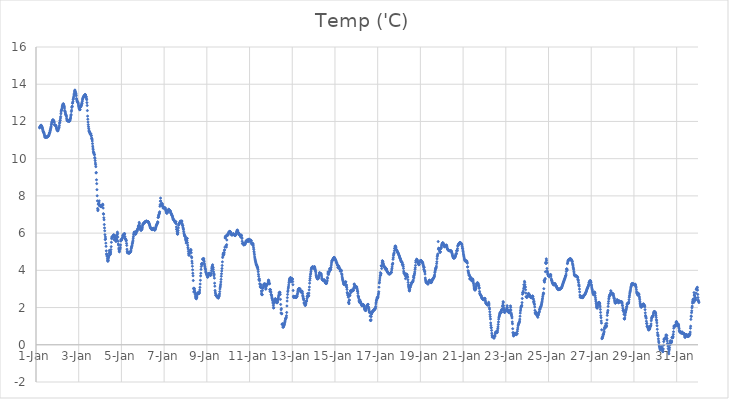
| Category | Temp ('C) |
|---|---|
| 44562.166666666664 | 11.653 |
| 44562.177083333336 | 11.686 |
| 44562.1875 | 11.711 |
| 44562.197916666664 | 11.734 |
| 44562.208333333336 | 11.743 |
| 44562.21875 | 11.776 |
| 44562.229166666664 | 11.792 |
| 44562.239583333336 | 11.8 |
| 44562.25 | 11.762 |
| 44562.260416666664 | 11.75 |
| 44562.270833333336 | 11.735 |
| 44562.28125 | 11.699 |
| 44562.291666666664 | 11.669 |
| 44562.302083333336 | 11.627 |
| 44562.3125 | 11.573 |
| 44562.322916666664 | 11.516 |
| 44562.333333333336 | 11.466 |
| 44562.34375 | 11.437 |
| 44562.354166666664 | 11.416 |
| 44562.364583333336 | 11.396 |
| 44562.375 | 11.367 |
| 44562.385416666664 | 11.321 |
| 44562.395833333336 | 11.268 |
| 44562.40625 | 11.213 |
| 44562.416666666664 | 11.162 |
| 44562.427083333336 | 11.152 |
| 44562.4375 | 11.145 |
| 44562.447916666664 | 11.148 |
| 44562.458333333336 | 11.16 |
| 44562.46875 | 11.163 |
| 44562.479166666664 | 11.164 |
| 44562.489583333336 | 11.163 |
| 44562.5 | 11.165 |
| 44562.510416666664 | 11.163 |
| 44562.520833333336 | 11.162 |
| 44562.53125 | 11.174 |
| 44562.541666666664 | 11.178 |
| 44562.552083333336 | 11.177 |
| 44562.5625 | 11.188 |
| 44562.572916666664 | 11.216 |
| 44562.583333333336 | 11.239 |
| 44562.59375 | 11.242 |
| 44562.604166666664 | 11.268 |
| 44562.614583333336 | 11.314 |
| 44562.625 | 11.342 |
| 44562.635416666664 | 11.393 |
| 44562.645833333336 | 11.407 |
| 44562.65625 | 11.481 |
| 44562.666666666664 | 11.5 |
| 44562.677083333336 | 11.56 |
| 44562.6875 | 11.618 |
| 44562.697916666664 | 11.675 |
| 44562.708333333336 | 11.735 |
| 44562.71875 | 11.822 |
| 44562.729166666664 | 11.869 |
| 44562.739583333336 | 11.942 |
| 44562.75 | 11.98 |
| 44562.760416666664 | 12.007 |
| 44562.770833333336 | 12.048 |
| 44562.78125 | 12.068 |
| 44562.791666666664 | 12.091 |
| 44562.802083333336 | 12.08 |
| 44562.8125 | 12.052 |
| 44562.822916666664 | 12.029 |
| 44562.833333333336 | 12.02 |
| 44562.84375 | 12.016 |
| 44562.854166666664 | 11.953 |
| 44562.864583333336 | 11.833 |
| 44562.875 | 11.815 |
| 44562.885416666664 | 11.799 |
| 44562.895833333336 | 11.8 |
| 44562.90625 | 11.796 |
| 44562.916666666664 | 11.79 |
| 44562.927083333336 | 11.78 |
| 44562.9375 | 11.744 |
| 44562.947916666664 | 11.699 |
| 44562.958333333336 | 11.644 |
| 44562.96875 | 11.608 |
| 44562.979166666664 | 11.556 |
| 44562.989583333336 | 11.538 |
| 44563.0 | 11.521 |
| 44563.010416666664 | 11.506 |
| 44563.020833333336 | 11.498 |
| 44563.03125 | 11.497 |
| 44563.041666666664 | 11.579 |
| 44563.052083333336 | 11.621 |
| 44563.0625 | 11.634 |
| 44563.072916666664 | 11.665 |
| 44563.083333333336 | 11.705 |
| 44563.09375 | 11.792 |
| 44563.104166666664 | 11.906 |
| 44563.114583333336 | 11.948 |
| 44563.125 | 12.044 |
| 44563.135416666664 | 12.073 |
| 44563.145833333336 | 12.179 |
| 44563.15625 | 12.264 |
| 44563.166666666664 | 12.414 |
| 44563.177083333336 | 12.515 |
| 44563.1875 | 12.594 |
| 44563.197916666664 | 12.608 |
| 44563.208333333336 | 12.662 |
| 44563.21875 | 12.721 |
| 44563.229166666664 | 12.784 |
| 44563.239583333336 | 12.838 |
| 44563.25 | 12.876 |
| 44563.260416666664 | 12.915 |
| 44563.270833333336 | 12.939 |
| 44563.28125 | 12.95 |
| 44563.291666666664 | 12.912 |
| 44563.302083333336 | 12.872 |
| 44563.3125 | 12.833 |
| 44563.322916666664 | 12.792 |
| 44563.333333333336 | 12.719 |
| 44563.34375 | 12.595 |
| 44563.354166666664 | 12.549 |
| 44563.364583333336 | 12.517 |
| 44563.375 | 12.461 |
| 44563.385416666664 | 12.396 |
| 44563.395833333336 | 12.368 |
| 44563.40625 | 12.339 |
| 44563.416666666664 | 12.313 |
| 44563.427083333336 | 12.252 |
| 44563.4375 | 12.157 |
| 44563.447916666664 | 12.091 |
| 44563.458333333336 | 12.063 |
| 44563.46875 | 12.038 |
| 44563.479166666664 | 12.035 |
| 44563.489583333336 | 12.02 |
| 44563.5 | 12.035 |
| 44563.510416666664 | 12.028 |
| 44563.520833333336 | 12.026 |
| 44563.53125 | 12.025 |
| 44563.541666666664 | 12.026 |
| 44563.552083333336 | 12.018 |
| 44563.5625 | 12.006 |
| 44563.572916666664 | 12.018 |
| 44563.583333333336 | 12.092 |
| 44563.59375 | 12.052 |
| 44563.604166666664 | 12.129 |
| 44563.614583333336 | 12.17 |
| 44563.625 | 12.239 |
| 44563.635416666664 | 12.324 |
| 44563.645833333336 | 12.372 |
| 44563.65625 | 12.53 |
| 44563.666666666664 | 12.604 |
| 44563.677083333336 | 12.75 |
| 44563.6875 | 12.798 |
| 44563.697916666664 | 12.817 |
| 44563.708333333336 | 12.978 |
| 44563.71875 | 12.995 |
| 44563.729166666664 | 13.073 |
| 44563.739583333336 | 13.185 |
| 44563.75 | 13.213 |
| 44563.760416666664 | 13.286 |
| 44563.770833333336 | 13.358 |
| 44563.78125 | 13.432 |
| 44563.791666666664 | 13.501 |
| 44563.802083333336 | 13.584 |
| 44563.8125 | 13.65 |
| 44563.822916666664 | 13.689 |
| 44563.833333333336 | 13.632 |
| 44563.84375 | 13.591 |
| 44563.854166666664 | 13.549 |
| 44563.864583333336 | 13.497 |
| 44563.875 | 13.466 |
| 44563.885416666664 | 13.382 |
| 44563.895833333336 | 13.233 |
| 44563.90625 | 13.195 |
| 44563.916666666664 | 13.131 |
| 44563.927083333336 | 13.086 |
| 44563.9375 | 13.055 |
| 44563.947916666664 | 13.051 |
| 44563.958333333336 | 13.041 |
| 44563.96875 | 13.015 |
| 44563.979166666664 | 12.952 |
| 44563.989583333336 | 12.877 |
| 44564.0 | 12.81 |
| 44564.010416666664 | 12.758 |
| 44564.020833333336 | 12.703 |
| 44564.03125 | 12.663 |
| 44564.041666666664 | 12.643 |
| 44564.052083333336 | 12.626 |
| 44564.0625 | 12.634 |
| 44564.072916666664 | 12.762 |
| 44564.083333333336 | 12.764 |
| 44564.09375 | 12.793 |
| 44564.104166666664 | 12.836 |
| 44564.114583333336 | 12.833 |
| 44564.125 | 12.857 |
| 44564.135416666664 | 12.92 |
| 44564.145833333336 | 12.992 |
| 44564.15625 | 12.97 |
| 44564.166666666664 | 13.082 |
| 44564.177083333336 | 13.164 |
| 44564.1875 | 13.222 |
| 44564.197916666664 | 13.254 |
| 44564.208333333336 | 13.294 |
| 44564.21875 | 13.322 |
| 44564.229166666664 | 13.346 |
| 44564.239583333336 | 13.338 |
| 44564.25 | 13.369 |
| 44564.260416666664 | 13.374 |
| 44564.270833333336 | 13.396 |
| 44564.28125 | 13.422 |
| 44564.291666666664 | 13.429 |
| 44564.302083333336 | 13.448 |
| 44564.3125 | 13.434 |
| 44564.322916666664 | 13.419 |
| 44564.333333333336 | 13.321 |
| 44564.34375 | 13.332 |
| 44564.354166666664 | 13.311 |
| 44564.364583333336 | 13.224 |
| 44564.375 | 13.168 |
| 44564.385416666664 | 13.012 |
| 44564.395833333336 | 12.858 |
| 44564.40625 | 12.584 |
| 44564.416666666664 | 12.286 |
| 44564.427083333336 | 12.12 |
| 44564.4375 | 11.968 |
| 44564.447916666664 | 11.829 |
| 44564.458333333336 | 11.719 |
| 44564.46875 | 11.617 |
| 44564.479166666664 | 11.529 |
| 44564.489583333336 | 11.455 |
| 44564.5 | 11.462 |
| 44564.510416666664 | 11.439 |
| 44564.520833333336 | 11.388 |
| 44564.53125 | 11.343 |
| 44564.541666666664 | 11.32 |
| 44564.552083333336 | 11.34 |
| 44564.5625 | 11.329 |
| 44564.572916666664 | 11.33 |
| 44564.583333333336 | 11.227 |
| 44564.59375 | 11.24 |
| 44564.604166666664 | 11.104 |
| 44564.614583333336 | 11.09 |
| 44564.625 | 11.03 |
| 44564.635416666664 | 10.948 |
| 44564.645833333336 | 10.808 |
| 44564.65625 | 10.672 |
| 44564.666666666664 | 10.571 |
| 44564.677083333336 | 10.487 |
| 44564.6875 | 10.383 |
| 44564.697916666664 | 10.321 |
| 44564.708333333336 | 10.304 |
| 44564.71875 | 10.298 |
| 44564.729166666664 | 10.229 |
| 44564.739583333336 | 10.209 |
| 44564.75 | 10.063 |
| 44564.760416666664 | 10.008 |
| 44564.770833333336 | 9.892 |
| 44564.78125 | 9.765 |
| 44564.791666666664 | 9.677 |
| 44564.802083333336 | 9.569 |
| 44564.8125 | 9.232 |
| 44564.822916666664 | 9.254 |
| 44564.833333333336 | 8.863 |
| 44564.84375 | 8.658 |
| 44564.854166666664 | 8.334 |
| 44564.864583333336 | 8.005 |
| 44564.875 | 7.733 |
| 44564.885416666664 | 7.324 |
| 44564.895833333336 | 7.207 |
| 44564.90625 | 7.257 |
| 44564.916666666664 | 7.551 |
| 44564.927083333336 | 7.576 |
| 44564.9375 | 7.554 |
| 44564.947916666664 | 7.664 |
| 44564.958333333336 | 7.733 |
| 44564.96875 | 7.473 |
| 44564.979166666664 | 7.481 |
| 44564.989583333336 | 7.517 |
| 44565.0 | 7.473 |
| 44565.010416666664 | 7.484 |
| 44565.020833333336 | 7.464 |
| 44565.03125 | 7.455 |
| 44565.041666666664 | 7.416 |
| 44565.052083333336 | 7.427 |
| 44565.0625 | 7.426 |
| 44565.072916666664 | 7.438 |
| 44565.083333333336 | 7.469 |
| 44565.09375 | 7.502 |
| 44565.104166666664 | 7.497 |
| 44565.114583333336 | 7.528 |
| 44565.125 | 7.553 |
| 44565.135416666664 | 7.506 |
| 44565.145833333336 | 7.346 |
| 44565.15625 | 7.044 |
| 44565.166666666664 | 7.017 |
| 44565.177083333336 | 6.826 |
| 44565.1875 | 6.715 |
| 44565.197916666664 | 6.461 |
| 44565.208333333336 | 6.279 |
| 44565.21875 | 6.123 |
| 44565.229166666664 | 5.917 |
| 44565.239583333336 | 5.652 |
| 44565.25 | 5.792 |
| 44565.260416666664 | 5.684 |
| 44565.270833333336 | 5.461 |
| 44565.28125 | 5.289 |
| 44565.291666666664 | 5.046 |
| 44565.302083333336 | 4.882 |
| 44565.3125 | 4.861 |
| 44565.322916666664 | 4.787 |
| 44565.333333333336 | 4.739 |
| 44565.34375 | 4.618 |
| 44565.354166666664 | 4.521 |
| 44565.364583333336 | 4.482 |
| 44565.375 | 4.521 |
| 44565.385416666664 | 4.553 |
| 44565.395833333336 | 4.665 |
| 44565.40625 | 4.728 |
| 44565.416666666664 | 4.79 |
| 44565.427083333336 | 4.924 |
| 44565.4375 | 5.073 |
| 44565.447916666664 | 5.028 |
| 44565.458333333336 | 4.935 |
| 44565.46875 | 4.851 |
| 44565.479166666664 | 4.852 |
| 44565.489583333336 | 4.915 |
| 44565.5 | 4.986 |
| 44565.510416666664 | 5.112 |
| 44565.520833333336 | 5.271 |
| 44565.53125 | 5.505 |
| 44565.541666666664 | 5.702 |
| 44565.552083333336 | 5.779 |
| 44565.5625 | 5.811 |
| 44565.572916666664 | 5.786 |
| 44565.583333333336 | 5.775 |
| 44565.59375 | 5.79 |
| 44565.604166666664 | 5.819 |
| 44565.614583333336 | 5.856 |
| 44565.625 | 5.889 |
| 44565.635416666664 | 5.913 |
| 44565.645833333336 | 5.847 |
| 44565.65625 | 5.658 |
| 44565.666666666664 | 5.653 |
| 44565.677083333336 | 5.881 |
| 44565.6875 | 5.862 |
| 44565.697916666664 | 5.799 |
| 44565.708333333336 | 5.754 |
| 44565.71875 | 5.759 |
| 44565.729166666664 | 5.73 |
| 44565.739583333336 | 5.555 |
| 44565.75 | 5.565 |
| 44565.760416666664 | 5.69 |
| 44565.770833333336 | 5.634 |
| 44565.78125 | 5.671 |
| 44565.791666666664 | 5.845 |
| 44565.802083333336 | 5.92 |
| 44565.8125 | 6.053 |
| 44565.822916666664 | 5.979 |
| 44565.833333333336 | 5.787 |
| 44565.84375 | 5.563 |
| 44565.854166666664 | 5.414 |
| 44565.864583333336 | 5.355 |
| 44565.875 | 5.193 |
| 44565.885416666664 | 5.107 |
| 44565.895833333336 | 5.03 |
| 44565.90625 | 4.992 |
| 44565.916666666664 | 5.106 |
| 44565.927083333336 | 5.134 |
| 44565.9375 | 5.174 |
| 44565.947916666664 | 5.237 |
| 44565.958333333336 | 5.367 |
| 44565.96875 | 5.576 |
| 44565.979166666664 | 5.639 |
| 44565.989583333336 | 5.637 |
| 44566.0 | 5.654 |
| 44566.010416666664 | 5.629 |
| 44566.020833333336 | 5.673 |
| 44566.03125 | 5.718 |
| 44566.041666666664 | 5.738 |
| 44566.052083333336 | 5.766 |
| 44566.0625 | 5.846 |
| 44566.072916666664 | 5.885 |
| 44566.083333333336 | 5.898 |
| 44566.09375 | 5.909 |
| 44566.104166666664 | 5.923 |
| 44566.114583333336 | 5.945 |
| 44566.125 | 5.954 |
| 44566.135416666664 | 5.958 |
| 44566.145833333336 | 5.972 |
| 44566.15625 | 5.959 |
| 44566.166666666664 | 5.814 |
| 44566.177083333336 | 5.718 |
| 44566.1875 | 5.691 |
| 44566.197916666664 | 5.666 |
| 44566.208333333336 | 5.65 |
| 44566.21875 | 5.581 |
| 44566.229166666664 | 5.6 |
| 44566.239583333336 | 5.449 |
| 44566.25 | 5.339 |
| 44566.260416666664 | 5.136 |
| 44566.270833333336 | 5.029 |
| 44566.28125 | 4.939 |
| 44566.291666666664 | 4.975 |
| 44566.302083333336 | 4.953 |
| 44566.3125 | 4.948 |
| 44566.322916666664 | 4.969 |
| 44566.333333333336 | 4.964 |
| 44566.34375 | 4.92 |
| 44566.354166666664 | 4.92 |
| 44566.364583333336 | 4.934 |
| 44566.375 | 4.944 |
| 44566.385416666664 | 4.942 |
| 44566.395833333336 | 4.96 |
| 44566.40625 | 4.965 |
| 44566.416666666664 | 4.98 |
| 44566.427083333336 | 5.009 |
| 44566.4375 | 5.026 |
| 44566.447916666664 | 5.083 |
| 44566.458333333336 | 5.16 |
| 44566.46875 | 5.217 |
| 44566.479166666664 | 5.269 |
| 44566.489583333336 | 5.305 |
| 44566.5 | 5.355 |
| 44566.510416666664 | 5.427 |
| 44566.520833333336 | 5.477 |
| 44566.53125 | 5.542 |
| 44566.541666666664 | 5.62 |
| 44566.552083333336 | 5.727 |
| 44566.5625 | 5.821 |
| 44566.572916666664 | 5.922 |
| 44566.583333333336 | 5.984 |
| 44566.59375 | 6.043 |
| 44566.604166666664 | 6.059 |
| 44566.614583333336 | 6.032 |
| 44566.625 | 5.994 |
| 44566.635416666664 | 5.968 |
| 44566.645833333336 | 5.954 |
| 44566.65625 | 5.94 |
| 44566.666666666664 | 5.945 |
| 44566.677083333336 | 6.01 |
| 44566.6875 | 5.982 |
| 44566.697916666664 | 6.046 |
| 44566.708333333336 | 6.111 |
| 44566.71875 | 6.12 |
| 44566.729166666664 | 6.103 |
| 44566.739583333336 | 6.123 |
| 44566.75 | 6.193 |
| 44566.760416666664 | 6.196 |
| 44566.770833333336 | 6.254 |
| 44566.78125 | 6.255 |
| 44566.791666666664 | 6.369 |
| 44566.802083333336 | 6.36 |
| 44566.8125 | 6.412 |
| 44566.822916666664 | 6.432 |
| 44566.833333333336 | 6.576 |
| 44566.84375 | 6.502 |
| 44566.854166666664 | 6.388 |
| 44566.864583333336 | 6.284 |
| 44566.875 | 6.319 |
| 44566.885416666664 | 6.218 |
| 44566.895833333336 | 6.31 |
| 44566.90625 | 6.17 |
| 44566.916666666664 | 6.153 |
| 44566.927083333336 | 6.153 |
| 44566.9375 | 6.212 |
| 44566.947916666664 | 6.194 |
| 44566.958333333336 | 6.214 |
| 44566.96875 | 6.24 |
| 44566.979166666664 | 6.313 |
| 44566.989583333336 | 6.395 |
| 44567.0 | 6.447 |
| 44567.010416666664 | 6.486 |
| 44567.020833333336 | 6.503 |
| 44567.03125 | 6.52 |
| 44567.041666666664 | 6.53 |
| 44567.052083333336 | 6.537 |
| 44567.0625 | 6.539 |
| 44567.072916666664 | 6.548 |
| 44567.083333333336 | 6.569 |
| 44567.09375 | 6.591 |
| 44567.104166666664 | 6.602 |
| 44567.114583333336 | 6.611 |
| 44567.125 | 6.619 |
| 44567.135416666664 | 6.626 |
| 44567.145833333336 | 6.634 |
| 44567.15625 | 6.638 |
| 44567.166666666664 | 6.643 |
| 44567.177083333336 | 6.643 |
| 44567.1875 | 6.633 |
| 44567.197916666664 | 6.634 |
| 44567.208333333336 | 6.623 |
| 44567.21875 | 6.613 |
| 44567.229166666664 | 6.609 |
| 44567.239583333336 | 6.624 |
| 44567.25 | 6.614 |
| 44567.260416666664 | 6.602 |
| 44567.270833333336 | 6.585 |
| 44567.28125 | 6.557 |
| 44567.291666666664 | 6.52 |
| 44567.302083333336 | 6.494 |
| 44567.3125 | 6.464 |
| 44567.322916666664 | 6.425 |
| 44567.333333333336 | 6.382 |
| 44567.34375 | 6.341 |
| 44567.354166666664 | 6.307 |
| 44567.364583333336 | 6.283 |
| 44567.375 | 6.261 |
| 44567.385416666664 | 6.237 |
| 44567.395833333336 | 6.223 |
| 44567.40625 | 6.236 |
| 44567.416666666664 | 6.194 |
| 44567.427083333336 | 6.204 |
| 44567.4375 | 6.182 |
| 44567.447916666664 | 6.195 |
| 44567.458333333336 | 6.227 |
| 44567.46875 | 6.231 |
| 44567.479166666664 | 6.238 |
| 44567.489583333336 | 6.232 |
| 44567.5 | 6.262 |
| 44567.510416666664 | 6.21 |
| 44567.520833333336 | 6.214 |
| 44567.53125 | 6.207 |
| 44567.541666666664 | 6.177 |
| 44567.552083333336 | 6.167 |
| 44567.5625 | 6.167 |
| 44567.572916666664 | 6.171 |
| 44567.583333333336 | 6.19 |
| 44567.59375 | 6.236 |
| 44567.604166666664 | 6.284 |
| 44567.614583333336 | 6.325 |
| 44567.625 | 6.369 |
| 44567.635416666664 | 6.408 |
| 44567.645833333336 | 6.433 |
| 44567.65625 | 6.464 |
| 44567.666666666664 | 6.493 |
| 44567.677083333336 | 6.507 |
| 44567.6875 | 6.544 |
| 44567.697916666664 | 6.608 |
| 44567.708333333336 | 6.584 |
| 44567.71875 | 6.841 |
| 44567.729166666664 | 6.844 |
| 44567.739583333336 | 6.959 |
| 44567.75 | 6.918 |
| 44567.760416666664 | 7.009 |
| 44567.770833333336 | 7.085 |
| 44567.78125 | 7.059 |
| 44567.791666666664 | 7.145 |
| 44567.802083333336 | 7.439 |
| 44567.8125 | 7.521 |
| 44567.822916666664 | 7.715 |
| 44567.833333333336 | 7.882 |
| 44567.84375 | 7.723 |
| 44567.854166666664 | 7.577 |
| 44567.864583333336 | 7.498 |
| 44567.875 | 7.531 |
| 44567.885416666664 | 7.52 |
| 44567.895833333336 | 7.595 |
| 44567.90625 | 7.545 |
| 44567.916666666664 | 7.57 |
| 44567.927083333336 | 7.485 |
| 44567.9375 | 7.416 |
| 44567.947916666664 | 7.401 |
| 44567.958333333336 | 7.338 |
| 44567.96875 | 7.396 |
| 44567.979166666664 | 7.367 |
| 44567.989583333336 | 7.357 |
| 44568.0 | 7.358 |
| 44568.010416666664 | 7.352 |
| 44568.020833333336 | 7.351 |
| 44568.03125 | 7.35 |
| 44568.041666666664 | 7.354 |
| 44568.052083333336 | 7.353 |
| 44568.0625 | 7.295 |
| 44568.072916666664 | 7.245 |
| 44568.083333333336 | 7.214 |
| 44568.09375 | 7.168 |
| 44568.104166666664 | 7.121 |
| 44568.114583333336 | 7.086 |
| 44568.125 | 7.068 |
| 44568.135416666664 | 7.076 |
| 44568.145833333336 | 7.093 |
| 44568.15625 | 7.12 |
| 44568.166666666664 | 7.145 |
| 44568.177083333336 | 7.18 |
| 44568.1875 | 7.203 |
| 44568.197916666664 | 7.241 |
| 44568.208333333336 | 7.268 |
| 44568.21875 | 7.286 |
| 44568.229166666664 | 7.235 |
| 44568.239583333336 | 7.231 |
| 44568.25 | 7.224 |
| 44568.260416666664 | 7.218 |
| 44568.270833333336 | 7.203 |
| 44568.28125 | 7.202 |
| 44568.291666666664 | 7.168 |
| 44568.302083333336 | 7.132 |
| 44568.3125 | 7.089 |
| 44568.322916666664 | 7.061 |
| 44568.333333333336 | 7.044 |
| 44568.34375 | 7.01 |
| 44568.354166666664 | 6.973 |
| 44568.364583333336 | 6.968 |
| 44568.375 | 6.951 |
| 44568.385416666664 | 6.906 |
| 44568.395833333336 | 6.868 |
| 44568.40625 | 6.817 |
| 44568.416666666664 | 6.768 |
| 44568.427083333336 | 6.73 |
| 44568.4375 | 6.735 |
| 44568.447916666664 | 6.724 |
| 44568.458333333336 | 6.701 |
| 44568.46875 | 6.675 |
| 44568.479166666664 | 6.659 |
| 44568.489583333336 | 6.648 |
| 44568.5 | 6.606 |
| 44568.510416666664 | 6.591 |
| 44568.520833333336 | 6.599 |
| 44568.53125 | 6.554 |
| 44568.541666666664 | 6.618 |
| 44568.552083333336 | 6.606 |
| 44568.5625 | 6.5 |
| 44568.572916666664 | 6.331 |
| 44568.583333333336 | 6.209 |
| 44568.59375 | 6.198 |
| 44568.604166666664 | 6.102 |
| 44568.614583333336 | 5.999 |
| 44568.625 | 5.944 |
| 44568.635416666664 | 5.944 |
| 44568.645833333336 | 6.025 |
| 44568.65625 | 6.137 |
| 44568.666666666664 | 6.279 |
| 44568.677083333336 | 6.418 |
| 44568.6875 | 6.456 |
| 44568.697916666664 | 6.499 |
| 44568.708333333336 | 6.522 |
| 44568.71875 | 6.541 |
| 44568.729166666664 | 6.518 |
| 44568.739583333336 | 6.555 |
| 44568.75 | 6.627 |
| 44568.760416666664 | 6.647 |
| 44568.770833333336 | 6.621 |
| 44568.78125 | 6.624 |
| 44568.791666666664 | 6.59 |
| 44568.802083333336 | 6.605 |
| 44568.8125 | 6.63 |
| 44568.822916666664 | 6.645 |
| 44568.833333333336 | 6.648 |
| 44568.84375 | 6.517 |
| 44568.854166666664 | 6.445 |
| 44568.864583333336 | 6.399 |
| 44568.875 | 6.398 |
| 44568.885416666664 | 6.296 |
| 44568.895833333336 | 6.234 |
| 44568.90625 | 6.188 |
| 44568.916666666664 | 6.083 |
| 44568.927083333336 | 6.001 |
| 44568.9375 | 5.95 |
| 44568.947916666664 | 5.897 |
| 44568.958333333336 | 5.884 |
| 44568.96875 | 5.82 |
| 44568.979166666664 | 5.825 |
| 44568.989583333336 | 5.833 |
| 44569.0 | 5.694 |
| 44569.010416666664 | 5.642 |
| 44569.020833333336 | 5.594 |
| 44569.03125 | 5.466 |
| 44569.041666666664 | 5.536 |
| 44569.052083333336 | 5.606 |
| 44569.0625 | 5.605 |
| 44569.072916666664 | 5.722 |
| 44569.083333333336 | 5.709 |
| 44569.09375 | 5.487 |
| 44569.104166666664 | 5.351 |
| 44569.114583333336 | 5.228 |
| 44569.125 | 5.146 |
| 44569.135416666664 | 5.02 |
| 44569.145833333336 | 4.909 |
| 44569.15625 | 4.828 |
| 44569.166666666664 | 4.809 |
| 44569.177083333336 | 4.83 |
| 44569.1875 | 4.923 |
| 44569.197916666664 | 4.98 |
| 44569.208333333336 | 5.031 |
| 44569.21875 | 5.052 |
| 44569.229166666664 | 5.043 |
| 44569.239583333336 | 5.095 |
| 44569.25 | 5.12 |
| 44569.260416666664 | 5.076 |
| 44569.270833333336 | 4.944 |
| 44569.28125 | 4.735 |
| 44569.291666666664 | 4.676 |
| 44569.302083333336 | 4.495 |
| 44569.3125 | 4.382 |
| 44569.322916666664 | 4.219 |
| 44569.333333333336 | 4.027 |
| 44569.34375 | 3.843 |
| 44569.354166666664 | 3.706 |
| 44569.364583333336 | 3.452 |
| 44569.375 | 3.019 |
| 44569.385416666664 | 2.841 |
| 44569.395833333336 | 3.046 |
| 44569.40625 | 3 |
| 44569.416666666664 | 3.017 |
| 44569.427083333336 | 2.925 |
| 44569.4375 | 2.844 |
| 44569.447916666664 | 2.789 |
| 44569.458333333336 | 2.701 |
| 44569.46875 | 2.611 |
| 44569.479166666664 | 2.518 |
| 44569.489583333336 | 2.53 |
| 44569.5 | 2.491 |
| 44569.510416666664 | 2.471 |
| 44569.520833333336 | 2.523 |
| 44569.53125 | 2.559 |
| 44569.541666666664 | 2.628 |
| 44569.552083333336 | 2.715 |
| 44569.5625 | 2.774 |
| 44569.572916666664 | 2.76 |
| 44569.583333333336 | 2.758 |
| 44569.59375 | 2.808 |
| 44569.604166666664 | 2.769 |
| 44569.614583333336 | 2.77 |
| 44569.625 | 2.76 |
| 44569.635416666664 | 2.757 |
| 44569.645833333336 | 2.783 |
| 44569.65625 | 2.838 |
| 44569.666666666664 | 2.943 |
| 44569.677083333336 | 3.083 |
| 44569.6875 | 3.264 |
| 44569.697916666664 | 3.466 |
| 44569.708333333336 | 3.7 |
| 44569.71875 | 3.844 |
| 44569.729166666664 | 4.051 |
| 44569.739583333336 | 4.203 |
| 44569.75 | 4.317 |
| 44569.760416666664 | 4.36 |
| 44569.770833333336 | 4.372 |
| 44569.78125 | 4.313 |
| 44569.791666666664 | 4.351 |
| 44569.802083333336 | 4.59 |
| 44569.8125 | 4.609 |
| 44569.822916666664 | 4.61 |
| 44569.833333333336 | 4.617 |
| 44569.84375 | 4.544 |
| 44569.854166666664 | 4.635 |
| 44569.864583333336 | 4.548 |
| 44569.875 | 4.46 |
| 44569.885416666664 | 4.362 |
| 44569.895833333336 | 4.287 |
| 44569.90625 | 4.211 |
| 44569.916666666664 | 4.128 |
| 44569.927083333336 | 4.085 |
| 44569.9375 | 4.039 |
| 44569.947916666664 | 3.954 |
| 44569.958333333336 | 3.888 |
| 44569.96875 | 3.867 |
| 44569.979166666664 | 3.834 |
| 44569.989583333336 | 3.779 |
| 44570.0 | 3.752 |
| 44570.010416666664 | 3.705 |
| 44570.020833333336 | 3.694 |
| 44570.03125 | 3.639 |
| 44570.041666666664 | 3.635 |
| 44570.052083333336 | 3.652 |
| 44570.0625 | 3.703 |
| 44570.072916666664 | 3.738 |
| 44570.083333333336 | 3.773 |
| 44570.09375 | 3.823 |
| 44570.104166666664 | 3.848 |
| 44570.114583333336 | 3.828 |
| 44570.125 | 3.836 |
| 44570.135416666664 | 3.813 |
| 44570.145833333336 | 3.789 |
| 44570.15625 | 3.755 |
| 44570.166666666664 | 3.732 |
| 44570.177083333336 | 3.732 |
| 44570.1875 | 3.748 |
| 44570.197916666664 | 3.774 |
| 44570.208333333336 | 3.848 |
| 44570.21875 | 3.975 |
| 44570.229166666664 | 4.079 |
| 44570.239583333336 | 4.161 |
| 44570.25 | 4.215 |
| 44570.260416666664 | 4.233 |
| 44570.270833333336 | 4.301 |
| 44570.28125 | 4.151 |
| 44570.291666666664 | 4.161 |
| 44570.302083333336 | 4.057 |
| 44570.3125 | 3.926 |
| 44570.322916666664 | 3.836 |
| 44570.333333333336 | 3.708 |
| 44570.34375 | 3.79 |
| 44570.354166666664 | 3.581 |
| 44570.364583333336 | 3.309 |
| 44570.375 | 3.148 |
| 44570.385416666664 | 2.919 |
| 44570.395833333336 | 2.831 |
| 44570.40625 | 2.752 |
| 44570.416666666664 | 2.666 |
| 44570.427083333336 | 2.659 |
| 44570.4375 | 2.667 |
| 44570.447916666664 | 2.644 |
| 44570.458333333336 | 2.639 |
| 44570.46875 | 2.612 |
| 44570.479166666664 | 2.578 |
| 44570.489583333336 | 2.55 |
| 44570.5 | 2.556 |
| 44570.510416666664 | 2.545 |
| 44570.520833333336 | 2.554 |
| 44570.53125 | 2.505 |
| 44570.541666666664 | 2.523 |
| 44570.552083333336 | 2.59 |
| 44570.5625 | 2.577 |
| 44570.572916666664 | 2.61 |
| 44570.583333333336 | 2.666 |
| 44570.59375 | 2.737 |
| 44570.604166666664 | 2.857 |
| 44570.614583333336 | 3 |
| 44570.625 | 3.094 |
| 44570.635416666664 | 3.16 |
| 44570.645833333336 | 3.252 |
| 44570.65625 | 3.376 |
| 44570.666666666664 | 3.513 |
| 44570.677083333336 | 3.679 |
| 44570.6875 | 3.816 |
| 44570.697916666664 | 3.963 |
| 44570.708333333336 | 4.099 |
| 44570.71875 | 4.26 |
| 44570.729166666664 | 4.455 |
| 44570.739583333336 | 4.688 |
| 44570.75 | 4.765 |
| 44570.760416666664 | 4.848 |
| 44570.770833333336 | 4.901 |
| 44570.78125 | 4.938 |
| 44570.791666666664 | 4.83 |
| 44570.802083333336 | 4.874 |
| 44570.8125 | 4.943 |
| 44570.822916666664 | 5.068 |
| 44570.833333333336 | 5.106 |
| 44570.84375 | 5.247 |
| 44570.854166666664 | 5.742 |
| 44570.864583333336 | 5.804 |
| 44570.875 | 5.735 |
| 44570.885416666664 | 5.847 |
| 44570.895833333336 | 5.837 |
| 44570.90625 | 5.327 |
| 44570.916666666664 | 5.251 |
| 44570.927083333336 | 5.381 |
| 44570.9375 | 5.63 |
| 44570.947916666664 | 5.858 |
| 44570.958333333336 | 5.886 |
| 44570.96875 | 5.937 |
| 44570.979166666664 | 5.897 |
| 44570.989583333336 | 5.895 |
| 44571.0 | 5.923 |
| 44571.010416666664 | 5.978 |
| 44571.020833333336 | 6.003 |
| 44571.03125 | 6.028 |
| 44571.041666666664 | 6.076 |
| 44571.052083333336 | 6.07 |
| 44571.0625 | 6.069 |
| 44571.072916666664 | 6.095 |
| 44571.083333333336 | 6.098 |
| 44571.09375 | 6.067 |
| 44571.104166666664 | 6.054 |
| 44571.114583333336 | 6.031 |
| 44571.125 | 6.009 |
| 44571.135416666664 | 5.983 |
| 44571.145833333336 | 5.944 |
| 44571.15625 | 5.894 |
| 44571.166666666664 | 5.92 |
| 44571.177083333336 | 5.913 |
| 44571.1875 | 5.904 |
| 44571.197916666664 | 5.908 |
| 44571.208333333336 | 5.922 |
| 44571.21875 | 5.944 |
| 44571.229166666664 | 5.953 |
| 44571.239583333336 | 5.957 |
| 44571.25 | 5.96 |
| 44571.260416666664 | 5.949 |
| 44571.270833333336 | 5.933 |
| 44571.28125 | 5.905 |
| 44571.291666666664 | 5.887 |
| 44571.302083333336 | 5.893 |
| 44571.3125 | 5.891 |
| 44571.322916666664 | 5.861 |
| 44571.333333333336 | 5.888 |
| 44571.34375 | 5.904 |
| 44571.354166666664 | 5.914 |
| 44571.364583333336 | 5.935 |
| 44571.375 | 5.915 |
| 44571.385416666664 | 6.054 |
| 44571.395833333336 | 6.023 |
| 44571.40625 | 6.108 |
| 44571.416666666664 | 6.158 |
| 44571.427083333336 | 6.16 |
| 44571.4375 | 6.144 |
| 44571.447916666664 | 6.12 |
| 44571.458333333336 | 6.063 |
| 44571.46875 | 6.026 |
| 44571.479166666664 | 6.004 |
| 44571.489583333336 | 5.997 |
| 44571.5 | 5.97 |
| 44571.510416666664 | 5.948 |
| 44571.520833333336 | 5.912 |
| 44571.53125 | 5.898 |
| 44571.541666666664 | 5.892 |
| 44571.552083333336 | 5.918 |
| 44571.5625 | 5.872 |
| 44571.572916666664 | 5.81 |
| 44571.583333333336 | 5.815 |
| 44571.59375 | 5.842 |
| 44571.604166666664 | 5.89 |
| 44571.614583333336 | 5.888 |
| 44571.625 | 5.864 |
| 44571.635416666664 | 5.754 |
| 44571.645833333336 | 5.715 |
| 44571.65625 | 5.563 |
| 44571.666666666664 | 5.443 |
| 44571.677083333336 | 5.44 |
| 44571.6875 | 5.441 |
| 44571.697916666664 | 5.431 |
| 44571.708333333336 | 5.424 |
| 44571.71875 | 5.409 |
| 44571.729166666664 | 5.355 |
| 44571.739583333336 | 5.376 |
| 44571.75 | 5.388 |
| 44571.760416666664 | 5.39 |
| 44571.770833333336 | 5.385 |
| 44571.78125 | 5.397 |
| 44571.791666666664 | 5.418 |
| 44571.802083333336 | 5.44 |
| 44571.8125 | 5.48 |
| 44571.822916666664 | 5.523 |
| 44571.833333333336 | 5.562 |
| 44571.84375 | 5.585 |
| 44571.854166666664 | 5.58 |
| 44571.864583333336 | 5.586 |
| 44571.875 | 5.579 |
| 44571.885416666664 | 5.628 |
| 44571.895833333336 | 5.641 |
| 44571.90625 | 5.559 |
| 44571.916666666664 | 5.615 |
| 44571.927083333336 | 5.587 |
| 44571.9375 | 5.543 |
| 44571.947916666664 | 5.61 |
| 44571.958333333336 | 5.62 |
| 44571.96875 | 5.66 |
| 44571.979166666664 | 5.68 |
| 44571.989583333336 | 5.649 |
| 44572.0 | 5.638 |
| 44572.010416666664 | 5.569 |
| 44572.020833333336 | 5.566 |
| 44572.03125 | 5.561 |
| 44572.041666666664 | 5.592 |
| 44572.052083333336 | 5.624 |
| 44572.0625 | 5.621 |
| 44572.072916666664 | 5.593 |
| 44572.083333333336 | 5.574 |
| 44572.09375 | 5.461 |
| 44572.104166666664 | 5.429 |
| 44572.114583333336 | 5.41 |
| 44572.125 | 5.404 |
| 44572.135416666664 | 5.389 |
| 44572.145833333336 | 5.433 |
| 44572.15625 | 5.444 |
| 44572.166666666664 | 5.387 |
| 44572.177083333336 | 5.311 |
| 44572.1875 | 5.208 |
| 44572.197916666664 | 5.119 |
| 44572.208333333336 | 5.007 |
| 44572.21875 | 4.928 |
| 44572.229166666664 | 4.834 |
| 44572.239583333336 | 4.721 |
| 44572.25 | 4.657 |
| 44572.260416666664 | 4.596 |
| 44572.270833333336 | 4.539 |
| 44572.28125 | 4.476 |
| 44572.291666666664 | 4.432 |
| 44572.302083333336 | 4.368 |
| 44572.3125 | 4.318 |
| 44572.322916666664 | 4.283 |
| 44572.333333333336 | 4.294 |
| 44572.34375 | 4.244 |
| 44572.354166666664 | 4.218 |
| 44572.364583333336 | 4.145 |
| 44572.375 | 4.169 |
| 44572.385416666664 | 4.125 |
| 44572.395833333336 | 4.041 |
| 44572.40625 | 3.926 |
| 44572.416666666664 | 3.786 |
| 44572.427083333336 | 3.678 |
| 44572.4375 | 3.484 |
| 44572.447916666664 | 3.508 |
| 44572.458333333336 | 3.549 |
| 44572.46875 | 3.444 |
| 44572.479166666664 | 3.274 |
| 44572.489583333336 | 3.261 |
| 44572.5 | 3.117 |
| 44572.510416666664 | 3.089 |
| 44572.520833333336 | 3.234 |
| 44572.53125 | 3.187 |
| 44572.541666666664 | 3.066 |
| 44572.552083333336 | 2.889 |
| 44572.5625 | 2.775 |
| 44572.572916666664 | 2.705 |
| 44572.583333333336 | 2.684 |
| 44572.59375 | 2.695 |
| 44572.604166666664 | 2.914 |
| 44572.614583333336 | 3.042 |
| 44572.625 | 3.07 |
| 44572.635416666664 | 3.057 |
| 44572.645833333336 | 3.08 |
| 44572.65625 | 3.174 |
| 44572.666666666664 | 3.24 |
| 44572.677083333336 | 3.231 |
| 44572.6875 | 3.279 |
| 44572.697916666664 | 3.271 |
| 44572.708333333336 | 3.247 |
| 44572.71875 | 3.2 |
| 44572.729166666664 | 3.24 |
| 44572.739583333336 | 3.268 |
| 44572.75 | 3.139 |
| 44572.760416666664 | 2.985 |
| 44572.770833333336 | 3.037 |
| 44572.78125 | 3.125 |
| 44572.791666666664 | 3.25 |
| 44572.802083333336 | 3.219 |
| 44572.8125 | 3.23 |
| 44572.822916666664 | 3.218 |
| 44572.833333333336 | 3.251 |
| 44572.84375 | 3.254 |
| 44572.854166666664 | 3.274 |
| 44572.864583333336 | 3.296 |
| 44572.875 | 3.377 |
| 44572.885416666664 | 3.474 |
| 44572.895833333336 | 3.457 |
| 44572.90625 | 3.413 |
| 44572.916666666664 | 3.332 |
| 44572.927083333336 | 3.285 |
| 44572.9375 | 3.28 |
| 44572.947916666664 | 2.961 |
| 44572.958333333336 | 2.875 |
| 44572.96875 | 2.968 |
| 44572.979166666664 | 2.96 |
| 44572.989583333336 | 2.855 |
| 44573.0 | 2.825 |
| 44573.010416666664 | 2.704 |
| 44573.020833333336 | 2.683 |
| 44573.03125 | 2.65 |
| 44573.041666666664 | 2.571 |
| 44573.052083333336 | 2.513 |
| 44573.0625 | 2.492 |
| 44573.072916666664 | 2.418 |
| 44573.083333333336 | 2.364 |
| 44573.09375 | 2.283 |
| 44573.104166666664 | 2.213 |
| 44573.114583333336 | 2.101 |
| 44573.125 | 1.977 |
| 44573.135416666664 | 1.988 |
| 44573.145833333336 | 2.223 |
| 44573.15625 | 2.273 |
| 44573.166666666664 | 2.295 |
| 44573.177083333336 | 2.368 |
| 44573.1875 | 2.423 |
| 44573.197916666664 | 2.449 |
| 44573.208333333336 | 2.482 |
| 44573.21875 | 2.446 |
| 44573.229166666664 | 2.425 |
| 44573.239583333336 | 2.409 |
| 44573.25 | 2.38 |
| 44573.260416666664 | 2.331 |
| 44573.270833333336 | 2.278 |
| 44573.28125 | 2.253 |
| 44573.291666666664 | 2.257 |
| 44573.302083333336 | 2.276 |
| 44573.3125 | 2.313 |
| 44573.322916666664 | 2.39 |
| 44573.333333333336 | 2.434 |
| 44573.34375 | 2.499 |
| 44573.354166666664 | 2.57 |
| 44573.364583333336 | 2.648 |
| 44573.375 | 2.721 |
| 44573.385416666664 | 2.79 |
| 44573.395833333336 | 2.799 |
| 44573.40625 | 2.812 |
| 44573.416666666664 | 2.828 |
| 44573.427083333336 | 2.789 |
| 44573.4375 | 2.699 |
| 44573.447916666664 | 2.44 |
| 44573.458333333336 | 2.168 |
| 44573.46875 | 1.707 |
| 44573.479166666664 | 1.883 |
| 44573.489583333336 | 1.948 |
| 44573.5 | 1.685 |
| 44573.510416666664 | 1.662 |
| 44573.520833333336 | 1.095 |
| 44573.53125 | 1.119 |
| 44573.541666666664 | 1.126 |
| 44573.552083333336 | 1.093 |
| 44573.5625 | 0.955 |
| 44573.572916666664 | 0.938 |
| 44573.583333333336 | 0.965 |
| 44573.59375 | 0.986 |
| 44573.604166666664 | 1.013 |
| 44573.614583333336 | 1.043 |
| 44573.625 | 1.081 |
| 44573.635416666664 | 1.126 |
| 44573.645833333336 | 1.191 |
| 44573.65625 | 1.234 |
| 44573.666666666664 | 1.29 |
| 44573.677083333336 | 1.385 |
| 44573.6875 | 1.407 |
| 44573.697916666664 | 1.406 |
| 44573.708333333336 | 1.449 |
| 44573.71875 | 1.484 |
| 44573.729166666664 | 1.565 |
| 44573.739583333336 | 1.737 |
| 44573.75 | 2.086 |
| 44573.760416666664 | 2.351 |
| 44573.770833333336 | 2.534 |
| 44573.78125 | 2.705 |
| 44573.791666666664 | 2.852 |
| 44573.802083333336 | 2.932 |
| 44573.8125 | 3.042 |
| 44573.822916666664 | 3.11 |
| 44573.833333333336 | 3.213 |
| 44573.84375 | 3.333 |
| 44573.854166666664 | 3.425 |
| 44573.864583333336 | 3.478 |
| 44573.875 | 3.52 |
| 44573.885416666664 | 3.555 |
| 44573.895833333336 | 3.579 |
| 44573.90625 | 3.594 |
| 44573.916666666664 | 3.6 |
| 44573.927083333336 | 3.604 |
| 44573.9375 | 3.477 |
| 44573.947916666664 | 3.375 |
| 44573.958333333336 | 3.482 |
| 44573.96875 | 3.521 |
| 44573.979166666664 | 3.484 |
| 44573.989583333336 | 3.553 |
| 44574.0 | 3.548 |
| 44574.010416666664 | 3.519 |
| 44574.020833333336 | 3.396 |
| 44574.03125 | 3.23 |
| 44574.041666666664 | 2.917 |
| 44574.052083333336 | 2.608 |
| 44574.0625 | 2.576 |
| 44574.072916666664 | 2.533 |
| 44574.083333333336 | 2.565 |
| 44574.09375 | 2.575 |
| 44574.104166666664 | 2.589 |
| 44574.114583333336 | 2.585 |
| 44574.125 | 2.579 |
| 44574.135416666664 | 2.59 |
| 44574.145833333336 | 2.579 |
| 44574.15625 | 2.598 |
| 44574.166666666664 | 2.541 |
| 44574.177083333336 | 2.529 |
| 44574.1875 | 2.543 |
| 44574.197916666664 | 2.56 |
| 44574.208333333336 | 2.585 |
| 44574.21875 | 2.603 |
| 44574.229166666664 | 2.624 |
| 44574.239583333336 | 2.707 |
| 44574.25 | 2.77 |
| 44574.260416666664 | 2.849 |
| 44574.270833333336 | 2.928 |
| 44574.28125 | 2.976 |
| 44574.291666666664 | 2.995 |
| 44574.302083333336 | 3.005 |
| 44574.3125 | 3.01 |
| 44574.322916666664 | 3.015 |
| 44574.333333333336 | 3.017 |
| 44574.34375 | 3.012 |
| 44574.354166666664 | 3.008 |
| 44574.364583333336 | 2.99 |
| 44574.375 | 2.939 |
| 44574.385416666664 | 2.882 |
| 44574.395833333336 | 2.846 |
| 44574.40625 | 2.84 |
| 44574.416666666664 | 2.847 |
| 44574.427083333336 | 2.85 |
| 44574.4375 | 2.851 |
| 44574.447916666664 | 2.875 |
| 44574.458333333336 | 2.883 |
| 44574.46875 | 2.836 |
| 44574.479166666664 | 2.757 |
| 44574.489583333336 | 2.657 |
| 44574.5 | 2.604 |
| 44574.510416666664 | 2.562 |
| 44574.520833333336 | 2.482 |
| 44574.53125 | 2.456 |
| 44574.541666666664 | 2.399 |
| 44574.552083333336 | 2.258 |
| 44574.5625 | 2.226 |
| 44574.572916666664 | 2.232 |
| 44574.583333333336 | 2.199 |
| 44574.59375 | 2.156 |
| 44574.604166666664 | 2.115 |
| 44574.614583333336 | 2.114 |
| 44574.625 | 2.164 |
| 44574.635416666664 | 2.214 |
| 44574.645833333336 | 2.322 |
| 44574.65625 | 2.323 |
| 44574.666666666664 | 2.336 |
| 44574.677083333336 | 2.354 |
| 44574.6875 | 2.473 |
| 44574.697916666664 | 2.588 |
| 44574.708333333336 | 2.62 |
| 44574.71875 | 2.749 |
| 44574.729166666664 | 2.617 |
| 44574.739583333336 | 2.621 |
| 44574.75 | 2.611 |
| 44574.760416666664 | 2.613 |
| 44574.770833333336 | 2.653 |
| 44574.78125 | 2.773 |
| 44574.791666666664 | 2.949 |
| 44574.802083333336 | 3.103 |
| 44574.8125 | 3.31 |
| 44574.822916666664 | 3.462 |
| 44574.833333333336 | 3.563 |
| 44574.84375 | 3.672 |
| 44574.854166666664 | 3.773 |
| 44574.864583333336 | 3.848 |
| 44574.875 | 3.935 |
| 44574.885416666664 | 4.027 |
| 44574.895833333336 | 4.081 |
| 44574.90625 | 4.124 |
| 44574.916666666664 | 4.153 |
| 44574.927083333336 | 4.17 |
| 44574.9375 | 4.177 |
| 44574.947916666664 | 4.178 |
| 44574.958333333336 | 4.189 |
| 44574.96875 | 4.169 |
| 44574.979166666664 | 4.128 |
| 44574.989583333336 | 4.12 |
| 44575.0 | 4.118 |
| 44575.010416666664 | 4.158 |
| 44575.020833333336 | 4.175 |
| 44575.03125 | 4.185 |
| 44575.041666666664 | 4.201 |
| 44575.052083333336 | 4.142 |
| 44575.0625 | 4.087 |
| 44575.072916666664 | 4.047 |
| 44575.083333333336 | 3.991 |
| 44575.09375 | 3.943 |
| 44575.104166666664 | 3.859 |
| 44575.114583333336 | 3.752 |
| 44575.125 | 3.705 |
| 44575.135416666664 | 3.66 |
| 44575.145833333336 | 3.622 |
| 44575.15625 | 3.601 |
| 44575.166666666664 | 3.558 |
| 44575.177083333336 | 3.548 |
| 44575.1875 | 3.546 |
| 44575.197916666664 | 3.546 |
| 44575.208333333336 | 3.543 |
| 44575.21875 | 3.571 |
| 44575.229166666664 | 3.612 |
| 44575.239583333336 | 3.639 |
| 44575.25 | 3.715 |
| 44575.260416666664 | 3.785 |
| 44575.270833333336 | 3.866 |
| 44575.28125 | 3.877 |
| 44575.291666666664 | 3.836 |
| 44575.302083333336 | 3.82 |
| 44575.3125 | 3.828 |
| 44575.322916666664 | 3.834 |
| 44575.333333333336 | 3.83 |
| 44575.34375 | 3.815 |
| 44575.354166666664 | 3.786 |
| 44575.364583333336 | 3.727 |
| 44575.375 | 3.648 |
| 44575.385416666664 | 3.574 |
| 44575.395833333336 | 3.522 |
| 44575.40625 | 3.5 |
| 44575.416666666664 | 3.494 |
| 44575.427083333336 | 3.482 |
| 44575.4375 | 3.472 |
| 44575.447916666664 | 3.463 |
| 44575.458333333336 | 3.462 |
| 44575.46875 | 3.464 |
| 44575.479166666664 | 3.464 |
| 44575.489583333336 | 3.457 |
| 44575.5 | 3.498 |
| 44575.510416666664 | 3.461 |
| 44575.520833333336 | 3.426 |
| 44575.53125 | 3.385 |
| 44575.541666666664 | 3.345 |
| 44575.552083333336 | 3.347 |
| 44575.5625 | 3.327 |
| 44575.572916666664 | 3.299 |
| 44575.583333333336 | 3.33 |
| 44575.59375 | 3.292 |
| 44575.604166666664 | 3.3 |
| 44575.614583333336 | 3.32 |
| 44575.625 | 3.386 |
| 44575.635416666664 | 3.451 |
| 44575.645833333336 | 3.62 |
| 44575.65625 | 3.566 |
| 44575.666666666664 | 3.805 |
| 44575.677083333336 | 3.919 |
| 44575.6875 | 3.884 |
| 44575.697916666664 | 3.77 |
| 44575.708333333336 | 3.852 |
| 44575.71875 | 3.905 |
| 44575.729166666664 | 3.936 |
| 44575.739583333336 | 3.929 |
| 44575.75 | 4.095 |
| 44575.760416666664 | 4.053 |
| 44575.770833333336 | 4.07 |
| 44575.78125 | 4.061 |
| 44575.791666666664 | 4.043 |
| 44575.802083333336 | 4.031 |
| 44575.8125 | 4.152 |
| 44575.822916666664 | 4.242 |
| 44575.833333333336 | 4.339 |
| 44575.84375 | 4.432 |
| 44575.854166666664 | 4.494 |
| 44575.864583333336 | 4.527 |
| 44575.875 | 4.522 |
| 44575.885416666664 | 4.546 |
| 44575.895833333336 | 4.576 |
| 44575.90625 | 4.6 |
| 44575.916666666664 | 4.627 |
| 44575.927083333336 | 4.641 |
| 44575.9375 | 4.663 |
| 44575.947916666664 | 4.684 |
| 44575.958333333336 | 4.691 |
| 44575.96875 | 4.69 |
| 44575.979166666664 | 4.684 |
| 44575.989583333336 | 4.637 |
| 44576.0 | 4.584 |
| 44576.010416666664 | 4.592 |
| 44576.020833333336 | 4.582 |
| 44576.03125 | 4.557 |
| 44576.041666666664 | 4.522 |
| 44576.052083333336 | 4.49 |
| 44576.0625 | 4.439 |
| 44576.072916666664 | 4.414 |
| 44576.083333333336 | 4.403 |
| 44576.09375 | 4.371 |
| 44576.104166666664 | 4.293 |
| 44576.114583333336 | 4.296 |
| 44576.125 | 4.267 |
| 44576.135416666664 | 4.171 |
| 44576.145833333336 | 4.132 |
| 44576.15625 | 4.142 |
| 44576.166666666664 | 4.243 |
| 44576.177083333336 | 4.209 |
| 44576.1875 | 4.179 |
| 44576.197916666664 | 4.136 |
| 44576.208333333336 | 4.115 |
| 44576.21875 | 4.086 |
| 44576.229166666664 | 4.059 |
| 44576.239583333336 | 4.038 |
| 44576.25 | 3.949 |
| 44576.260416666664 | 3.986 |
| 44576.270833333336 | 4 |
| 44576.28125 | 3.999 |
| 44576.291666666664 | 4.01 |
| 44576.302083333336 | 3.965 |
| 44576.3125 | 3.822 |
| 44576.322916666664 | 3.778 |
| 44576.333333333336 | 3.691 |
| 44576.34375 | 3.601 |
| 44576.354166666664 | 3.533 |
| 44576.364583333336 | 3.486 |
| 44576.375 | 3.445 |
| 44576.385416666664 | 3.389 |
| 44576.395833333336 | 3.334 |
| 44576.40625 | 3.284 |
| 44576.416666666664 | 3.256 |
| 44576.427083333336 | 3.23 |
| 44576.4375 | 3.256 |
| 44576.447916666664 | 3.264 |
| 44576.458333333336 | 3.299 |
| 44576.46875 | 3.333 |
| 44576.479166666664 | 3.35 |
| 44576.489583333336 | 3.372 |
| 44576.5 | 3.377 |
| 44576.510416666664 | 3.382 |
| 44576.520833333336 | 3.217 |
| 44576.53125 | 3.135 |
| 44576.541666666664 | 3.208 |
| 44576.552083333336 | 3.075 |
| 44576.5625 | 2.974 |
| 44576.572916666664 | 2.811 |
| 44576.583333333336 | 2.779 |
| 44576.59375 | 2.733 |
| 44576.604166666664 | 2.667 |
| 44576.614583333336 | 2.648 |
| 44576.625 | 2.553 |
| 44576.635416666664 | 2.279 |
| 44576.645833333336 | 2.274 |
| 44576.65625 | 2.206 |
| 44576.666666666664 | 2.378 |
| 44576.677083333336 | 2.409 |
| 44576.6875 | 2.651 |
| 44576.697916666664 | 2.64 |
| 44576.708333333336 | 2.737 |
| 44576.71875 | 2.889 |
| 44576.729166666664 | 2.908 |
| 44576.739583333336 | 2.869 |
| 44576.75 | 2.824 |
| 44576.760416666664 | 2.847 |
| 44576.770833333336 | 2.854 |
| 44576.78125 | 2.883 |
| 44576.791666666664 | 2.918 |
| 44576.802083333336 | 2.949 |
| 44576.8125 | 2.945 |
| 44576.822916666664 | 2.928 |
| 44576.833333333336 | 2.922 |
| 44576.84375 | 2.923 |
| 44576.854166666664 | 2.914 |
| 44576.864583333336 | 2.922 |
| 44576.875 | 3.006 |
| 44576.885416666664 | 3.087 |
| 44576.895833333336 | 3.261 |
| 44576.90625 | 3.257 |
| 44576.916666666664 | 3.218 |
| 44576.927083333336 | 3.162 |
| 44576.9375 | 3.117 |
| 44576.947916666664 | 3.095 |
| 44576.958333333336 | 3.098 |
| 44576.96875 | 3.103 |
| 44576.979166666664 | 3.114 |
| 44576.989583333336 | 3.108 |
| 44577.0 | 3.105 |
| 44577.010416666664 | 3.121 |
| 44577.020833333336 | 3.104 |
| 44577.03125 | 3.043 |
| 44577.041666666664 | 2.983 |
| 44577.052083333336 | 2.891 |
| 44577.0625 | 2.865 |
| 44577.072916666664 | 2.771 |
| 44577.083333333336 | 2.642 |
| 44577.09375 | 2.584 |
| 44577.104166666664 | 2.582 |
| 44577.114583333336 | 2.506 |
| 44577.125 | 2.399 |
| 44577.135416666664 | 2.333 |
| 44577.145833333336 | 2.299 |
| 44577.15625 | 2.312 |
| 44577.166666666664 | 2.256 |
| 44577.177083333336 | 2.395 |
| 44577.1875 | 2.309 |
| 44577.197916666664 | 2.3 |
| 44577.208333333336 | 2.29 |
| 44577.21875 | 2.238 |
| 44577.229166666664 | 2.197 |
| 44577.239583333336 | 2.177 |
| 44577.25 | 2.132 |
| 44577.260416666664 | 2.096 |
| 44577.270833333336 | 2.097 |
| 44577.28125 | 2.113 |
| 44577.291666666664 | 2.157 |
| 44577.302083333336 | 2.157 |
| 44577.3125 | 2.163 |
| 44577.322916666664 | 2.155 |
| 44577.333333333336 | 2.139 |
| 44577.34375 | 2.141 |
| 44577.354166666664 | 2.099 |
| 44577.364583333336 | 2.055 |
| 44577.375 | 1.989 |
| 44577.385416666664 | 1.941 |
| 44577.395833333336 | 1.897 |
| 44577.40625 | 1.871 |
| 44577.416666666664 | 1.861 |
| 44577.427083333336 | 1.849 |
| 44577.4375 | 1.839 |
| 44577.447916666664 | 1.853 |
| 44577.458333333336 | 1.909 |
| 44577.46875 | 1.956 |
| 44577.479166666664 | 2.024 |
| 44577.489583333336 | 2.075 |
| 44577.5 | 2.107 |
| 44577.510416666664 | 2.123 |
| 44577.520833333336 | 2.146 |
| 44577.53125 | 2.161 |
| 44577.541666666664 | 2.169 |
| 44577.552083333336 | 2.175 |
| 44577.5625 | 2.033 |
| 44577.572916666664 | 2.012 |
| 44577.583333333336 | 1.951 |
| 44577.59375 | 1.878 |
| 44577.604166666664 | 1.808 |
| 44577.614583333336 | 1.74 |
| 44577.625 | 1.767 |
| 44577.635416666664 | 1.716 |
| 44577.645833333336 | 1.538 |
| 44577.65625 | 1.319 |
| 44577.666666666664 | 1.307 |
| 44577.677083333336 | 1.303 |
| 44577.6875 | 1.344 |
| 44577.697916666664 | 1.512 |
| 44577.708333333336 | 1.633 |
| 44577.71875 | 1.662 |
| 44577.729166666664 | 1.77 |
| 44577.739583333336 | 1.719 |
| 44577.75 | 1.751 |
| 44577.760416666664 | 1.769 |
| 44577.770833333336 | 1.793 |
| 44577.78125 | 1.828 |
| 44577.791666666664 | 1.836 |
| 44577.802083333336 | 1.837 |
| 44577.8125 | 1.841 |
| 44577.822916666664 | 1.864 |
| 44577.833333333336 | 1.9 |
| 44577.84375 | 1.89 |
| 44577.854166666664 | 1.892 |
| 44577.864583333336 | 1.901 |
| 44577.875 | 1.927 |
| 44577.885416666664 | 1.953 |
| 44577.895833333336 | 1.989 |
| 44577.90625 | 2.061 |
| 44577.916666666664 | 2.193 |
| 44577.927083333336 | 2.279 |
| 44577.9375 | 2.358 |
| 44577.947916666664 | 2.396 |
| 44577.958333333336 | 2.44 |
| 44577.96875 | 2.496 |
| 44577.979166666664 | 2.534 |
| 44577.989583333336 | 2.562 |
| 44578.0 | 2.516 |
| 44578.010416666664 | 2.535 |
| 44578.020833333336 | 2.613 |
| 44578.03125 | 2.689 |
| 44578.041666666664 | 2.769 |
| 44578.052083333336 | 2.85 |
| 44578.0625 | 3.094 |
| 44578.072916666664 | 3.313 |
| 44578.083333333336 | 3.365 |
| 44578.09375 | 3.478 |
| 44578.104166666664 | 3.59 |
| 44578.114583333336 | 3.701 |
| 44578.125 | 3.876 |
| 44578.135416666664 | 3.744 |
| 44578.145833333336 | 3.752 |
| 44578.15625 | 3.83 |
| 44578.166666666664 | 4.248 |
| 44578.177083333336 | 4.232 |
| 44578.1875 | 4.101 |
| 44578.197916666664 | 4.246 |
| 44578.208333333336 | 4.4 |
| 44578.21875 | 4.517 |
| 44578.229166666664 | 4.497 |
| 44578.239583333336 | 4.4 |
| 44578.25 | 4.457 |
| 44578.260416666664 | 4.366 |
| 44578.270833333336 | 4.32 |
| 44578.28125 | 4.254 |
| 44578.291666666664 | 4.222 |
| 44578.302083333336 | 4.196 |
| 44578.3125 | 4.157 |
| 44578.322916666664 | 4.197 |
| 44578.333333333336 | 4.17 |
| 44578.34375 | 4.159 |
| 44578.354166666664 | 4.156 |
| 44578.364583333336 | 4.128 |
| 44578.375 | 4.039 |
| 44578.385416666664 | 4.05 |
| 44578.395833333336 | 4.078 |
| 44578.40625 | 4.086 |
| 44578.416666666664 | 4.061 |
| 44578.427083333336 | 4.004 |
| 44578.4375 | 3.954 |
| 44578.447916666664 | 3.926 |
| 44578.458333333336 | 3.908 |
| 44578.46875 | 3.885 |
| 44578.479166666664 | 3.87 |
| 44578.489583333336 | 3.864 |
| 44578.5 | 3.858 |
| 44578.510416666664 | 3.844 |
| 44578.520833333336 | 3.815 |
| 44578.53125 | 3.801 |
| 44578.541666666664 | 3.813 |
| 44578.552083333336 | 3.801 |
| 44578.5625 | 3.822 |
| 44578.572916666664 | 3.812 |
| 44578.583333333336 | 3.813 |
| 44578.59375 | 3.846 |
| 44578.604166666664 | 3.869 |
| 44578.614583333336 | 3.85 |
| 44578.625 | 3.876 |
| 44578.635416666664 | 3.895 |
| 44578.645833333336 | 3.894 |
| 44578.65625 | 4.017 |
| 44578.666666666664 | 4.097 |
| 44578.677083333336 | 4.185 |
| 44578.6875 | 4.303 |
| 44578.697916666664 | 4.336 |
| 44578.708333333336 | 4.383 |
| 44578.71875 | 4.59 |
| 44578.729166666664 | 4.674 |
| 44578.739583333336 | 4.79 |
| 44578.75 | 4.861 |
| 44578.760416666664 | 4.91 |
| 44578.770833333336 | 4.937 |
| 44578.78125 | 5.055 |
| 44578.791666666664 | 5.181 |
| 44578.802083333336 | 5.178 |
| 44578.8125 | 5.301 |
| 44578.822916666664 | 5.295 |
| 44578.833333333336 | 5.3 |
| 44578.84375 | 5.274 |
| 44578.854166666664 | 5.223 |
| 44578.864583333336 | 5.138 |
| 44578.875 | 5.076 |
| 44578.885416666664 | 5.081 |
| 44578.895833333336 | 5.086 |
| 44578.90625 | 5.061 |
| 44578.916666666664 | 5.014 |
| 44578.927083333336 | 4.991 |
| 44578.9375 | 4.975 |
| 44578.947916666664 | 4.949 |
| 44578.958333333336 | 4.922 |
| 44578.96875 | 4.902 |
| 44578.979166666664 | 4.878 |
| 44578.989583333336 | 4.834 |
| 44579.0 | 4.799 |
| 44579.010416666664 | 4.776 |
| 44579.020833333336 | 4.742 |
| 44579.03125 | 4.695 |
| 44579.041666666664 | 4.659 |
| 44579.052083333336 | 4.633 |
| 44579.0625 | 4.635 |
| 44579.072916666664 | 4.574 |
| 44579.083333333336 | 4.521 |
| 44579.09375 | 4.503 |
| 44579.104166666664 | 4.463 |
| 44579.114583333336 | 4.465 |
| 44579.125 | 4.442 |
| 44579.135416666664 | 4.422 |
| 44579.145833333336 | 4.438 |
| 44579.15625 | 4.318 |
| 44579.166666666664 | 4.308 |
| 44579.177083333336 | 4.28 |
| 44579.1875 | 4.305 |
| 44579.197916666664 | 4.206 |
| 44579.208333333336 | 4.099 |
| 44579.21875 | 3.955 |
| 44579.229166666664 | 3.876 |
| 44579.239583333336 | 3.838 |
| 44579.25 | 3.833 |
| 44579.260416666664 | 3.835 |
| 44579.270833333336 | 3.818 |
| 44579.28125 | 3.761 |
| 44579.291666666664 | 3.711 |
| 44579.302083333336 | 3.554 |
| 44579.3125 | 3.758 |
| 44579.322916666664 | 3.72 |
| 44579.333333333336 | 3.648 |
| 44579.34375 | 3.775 |
| 44579.354166666664 | 3.807 |
| 44579.364583333336 | 3.769 |
| 44579.375 | 3.775 |
| 44579.385416666664 | 3.693 |
| 44579.395833333336 | 3.659 |
| 44579.40625 | 3.63 |
| 44579.416666666664 | 3.492 |
| 44579.427083333336 | 3.35 |
| 44579.4375 | 3.224 |
| 44579.447916666664 | 3.144 |
| 44579.458333333336 | 3.074 |
| 44579.46875 | 3.005 |
| 44579.479166666664 | 2.912 |
| 44579.489583333336 | 2.889 |
| 44579.5 | 2.959 |
| 44579.510416666664 | 3.079 |
| 44579.520833333336 | 3.077 |
| 44579.53125 | 3.127 |
| 44579.541666666664 | 3.188 |
| 44579.552083333336 | 3.207 |
| 44579.5625 | 3.235 |
| 44579.572916666664 | 3.278 |
| 44579.583333333336 | 3.308 |
| 44579.59375 | 3.33 |
| 44579.604166666664 | 3.36 |
| 44579.614583333336 | 3.351 |
| 44579.625 | 3.383 |
| 44579.635416666664 | 3.366 |
| 44579.645833333336 | 3.402 |
| 44579.65625 | 3.432 |
| 44579.666666666664 | 3.485 |
| 44579.677083333336 | 3.629 |
| 44579.6875 | 3.701 |
| 44579.697916666664 | 3.593 |
| 44579.708333333336 | 3.71 |
| 44579.71875 | 3.791 |
| 44579.729166666664 | 3.842 |
| 44579.739583333336 | 3.919 |
| 44579.75 | 4.05 |
| 44579.760416666664 | 4.138 |
| 44579.770833333336 | 4.266 |
| 44579.78125 | 4.432 |
| 44579.791666666664 | 4.511 |
| 44579.802083333336 | 4.534 |
| 44579.8125 | 4.516 |
| 44579.822916666664 | 4.601 |
| 44579.833333333336 | 4.582 |
| 44579.84375 | 4.564 |
| 44579.854166666664 | 4.549 |
| 44579.864583333336 | 4.499 |
| 44579.875 | 4.453 |
| 44579.885416666664 | 4.417 |
| 44579.895833333336 | 4.371 |
| 44579.90625 | 4.378 |
| 44579.916666666664 | 4.345 |
| 44579.927083333336 | 4.296 |
| 44579.9375 | 4.305 |
| 44579.947916666664 | 4.328 |
| 44579.958333333336 | 4.445 |
| 44579.96875 | 4.449 |
| 44579.979166666664 | 4.443 |
| 44579.989583333336 | 4.475 |
| 44580.0 | 4.521 |
| 44580.010416666664 | 4.527 |
| 44580.020833333336 | 4.535 |
| 44580.03125 | 4.529 |
| 44580.041666666664 | 4.518 |
| 44580.052083333336 | 4.49 |
| 44580.0625 | 4.463 |
| 44580.072916666664 | 4.457 |
| 44580.083333333336 | 4.445 |
| 44580.09375 | 4.413 |
| 44580.104166666664 | 4.423 |
| 44580.114583333336 | 4.383 |
| 44580.125 | 4.327 |
| 44580.135416666664 | 4.269 |
| 44580.145833333336 | 4.201 |
| 44580.15625 | 4.062 |
| 44580.166666666664 | 4.164 |
| 44580.177083333336 | 4.168 |
| 44580.1875 | 4.01 |
| 44580.197916666664 | 3.941 |
| 44580.208333333336 | 3.914 |
| 44580.21875 | 3.801 |
| 44580.229166666664 | 3.589 |
| 44580.239583333336 | 3.502 |
| 44580.25 | 3.441 |
| 44580.260416666664 | 3.39 |
| 44580.270833333336 | 3.351 |
| 44580.28125 | 3.337 |
| 44580.291666666664 | 3.333 |
| 44580.302083333336 | 3.342 |
| 44580.3125 | 3.316 |
| 44580.322916666664 | 3.342 |
| 44580.333333333336 | 3.338 |
| 44580.34375 | 3.296 |
| 44580.354166666664 | 3.252 |
| 44580.364583333336 | 3.318 |
| 44580.375 | 3.341 |
| 44580.385416666664 | 3.361 |
| 44580.395833333336 | 3.387 |
| 44580.40625 | 3.444 |
| 44580.416666666664 | 3.456 |
| 44580.427083333336 | 3.464 |
| 44580.4375 | 3.47 |
| 44580.447916666664 | 3.403 |
| 44580.458333333336 | 3.37 |
| 44580.46875 | 3.357 |
| 44580.479166666664 | 3.35 |
| 44580.489583333336 | 3.344 |
| 44580.5 | 3.339 |
| 44580.510416666664 | 3.342 |
| 44580.520833333336 | 3.36 |
| 44580.53125 | 3.399 |
| 44580.541666666664 | 3.438 |
| 44580.552083333336 | 3.479 |
| 44580.5625 | 3.498 |
| 44580.572916666664 | 3.516 |
| 44580.583333333336 | 3.528 |
| 44580.59375 | 3.549 |
| 44580.604166666664 | 3.563 |
| 44580.614583333336 | 3.577 |
| 44580.625 | 3.594 |
| 44580.635416666664 | 3.617 |
| 44580.645833333336 | 3.691 |
| 44580.65625 | 3.674 |
| 44580.666666666664 | 3.757 |
| 44580.677083333336 | 3.874 |
| 44580.6875 | 3.922 |
| 44580.697916666664 | 4.005 |
| 44580.708333333336 | 4.073 |
| 44580.71875 | 4.128 |
| 44580.729166666664 | 4.099 |
| 44580.739583333336 | 4.155 |
| 44580.75 | 4.225 |
| 44580.760416666664 | 4.359 |
| 44580.770833333336 | 4.464 |
| 44580.78125 | 4.618 |
| 44580.791666666664 | 4.736 |
| 44580.802083333336 | 4.807 |
| 44580.8125 | 4.875 |
| 44580.833333333336 | 5.546 |
| 44580.84375 | 5.134 |
| 44580.854166666664 | 5.192 |
| 44580.864583333336 | 5.177 |
| 44580.875 | 5.162 |
| 44580.885416666664 | 5.133 |
| 44580.895833333336 | 5.092 |
| 44580.90625 | 5.008 |
| 44580.916666666664 | 4.956 |
| 44580.927083333336 | 4.995 |
| 44580.9375 | 5 |
| 44580.947916666664 | 5.156 |
| 44580.958333333336 | 5.191 |
| 44580.96875 | 5.186 |
| 44580.979166666664 | 5.231 |
| 44580.989583333336 | 5.308 |
| 44581.0 | 5.362 |
| 44581.010416666664 | 5.4 |
| 44581.020833333336 | 5.434 |
| 44581.03125 | 5.463 |
| 44581.041666666664 | 5.478 |
| 44581.052083333336 | 5.477 |
| 44581.0625 | 5.465 |
| 44581.072916666664 | 5.442 |
| 44581.083333333336 | 5.405 |
| 44581.09375 | 5.365 |
| 44581.104166666664 | 5.333 |
| 44581.114583333336 | 5.315 |
| 44581.125 | 5.263 |
| 44581.135416666664 | 5.277 |
| 44581.145833333336 | 5.343 |
| 44581.15625 | 5.302 |
| 44581.166666666664 | 5.317 |
| 44581.177083333336 | 5.319 |
| 44581.1875 | 5.325 |
| 44581.197916666664 | 5.345 |
| 44581.208333333336 | 5.364 |
| 44581.21875 | 5.343 |
| 44581.229166666664 | 5.339 |
| 44581.239583333336 | 5.281 |
| 44581.25 | 5.211 |
| 44581.260416666664 | 5.167 |
| 44581.270833333336 | 5.148 |
| 44581.28125 | 5.12 |
| 44581.291666666664 | 5.101 |
| 44581.302083333336 | 5.091 |
| 44581.3125 | 5.083 |
| 44581.322916666664 | 5.075 |
| 44581.333333333336 | 5.057 |
| 44581.34375 | 5.051 |
| 44581.354166666664 | 5.063 |
| 44581.364583333336 | 5.05 |
| 44581.375 | 5.056 |
| 44581.385416666664 | 5.069 |
| 44581.395833333336 | 5.064 |
| 44581.40625 | 5.059 |
| 44581.416666666664 | 5.057 |
| 44581.427083333336 | 5.049 |
| 44581.4375 | 5.043 |
| 44581.447916666664 | 5.023 |
| 44581.458333333336 | 5.013 |
| 44581.46875 | 4.971 |
| 44581.479166666664 | 4.909 |
| 44581.489583333336 | 4.874 |
| 44581.5 | 4.819 |
| 44581.510416666664 | 4.777 |
| 44581.520833333336 | 4.743 |
| 44581.53125 | 4.71 |
| 44581.541666666664 | 4.676 |
| 44581.552083333336 | 4.664 |
| 44581.5625 | 4.665 |
| 44581.572916666664 | 4.658 |
| 44581.583333333336 | 4.661 |
| 44581.59375 | 4.673 |
| 44581.604166666664 | 4.689 |
| 44581.614583333336 | 4.704 |
| 44581.625 | 4.724 |
| 44581.635416666664 | 4.744 |
| 44581.645833333336 | 4.79 |
| 44581.65625 | 4.832 |
| 44581.666666666664 | 4.867 |
| 44581.677083333336 | 4.902 |
| 44581.6875 | 4.903 |
| 44581.697916666664 | 5.043 |
| 44581.708333333336 | 5.071 |
| 44581.71875 | 5.034 |
| 44581.729166666664 | 5.078 |
| 44581.739583333336 | 5.169 |
| 44581.75 | 5.3 |
| 44581.760416666664 | 5.339 |
| 44581.770833333336 | 5.356 |
| 44581.78125 | 5.378 |
| 44581.791666666664 | 5.399 |
| 44581.802083333336 | 5.431 |
| 44581.8125 | 5.446 |
| 44581.822916666664 | 5.455 |
| 44581.833333333336 | 5.481 |
| 44581.84375 | 5.49 |
| 44581.854166666664 | 5.491 |
| 44581.864583333336 | 5.49 |
| 44581.875 | 5.489 |
| 44581.885416666664 | 5.481 |
| 44581.895833333336 | 5.452 |
| 44581.90625 | 5.436 |
| 44581.916666666664 | 5.437 |
| 44581.927083333336 | 5.432 |
| 44581.9375 | 5.406 |
| 44581.947916666664 | 5.361 |
| 44581.958333333336 | 5.285 |
| 44581.96875 | 5.194 |
| 44581.979166666664 | 5.169 |
| 44581.989583333336 | 5.088 |
| 44582.0 | 5.018 |
| 44582.010416666664 | 4.932 |
| 44582.020833333336 | 4.851 |
| 44582.03125 | 4.777 |
| 44582.041666666664 | 4.72 |
| 44582.052083333336 | 4.66 |
| 44582.0625 | 4.6 |
| 44582.072916666664 | 4.564 |
| 44582.083333333336 | 4.525 |
| 44582.09375 | 4.502 |
| 44582.104166666664 | 4.501 |
| 44582.114583333336 | 4.501 |
| 44582.125 | 4.5 |
| 44582.135416666664 | 4.496 |
| 44582.145833333336 | 4.491 |
| 44582.15625 | 4.496 |
| 44582.166666666664 | 4.511 |
| 44582.177083333336 | 4.473 |
| 44582.1875 | 4.422 |
| 44582.197916666664 | 4.382 |
| 44582.208333333336 | 4.18 |
| 44582.21875 | 4.189 |
| 44582.229166666664 | 3.972 |
| 44582.239583333336 | 3.969 |
| 44582.25 | 3.896 |
| 44582.260416666664 | 3.833 |
| 44582.270833333336 | 3.758 |
| 44582.28125 | 3.728 |
| 44582.291666666664 | 3.75 |
| 44582.302083333336 | 3.71 |
| 44582.3125 | 3.532 |
| 44582.322916666664 | 3.558 |
| 44582.333333333336 | 3.588 |
| 44582.34375 | 3.645 |
| 44582.354166666664 | 3.596 |
| 44582.364583333336 | 3.568 |
| 44582.375 | 3.539 |
| 44582.385416666664 | 3.475 |
| 44582.395833333336 | 3.472 |
| 44582.40625 | 3.436 |
| 44582.416666666664 | 3.455 |
| 44582.427083333336 | 3.498 |
| 44582.4375 | 3.526 |
| 44582.447916666664 | 3.538 |
| 44582.458333333336 | 3.504 |
| 44582.46875 | 3.456 |
| 44582.479166666664 | 3.371 |
| 44582.489583333336 | 3.294 |
| 44582.5 | 3.209 |
| 44582.510416666664 | 3.11 |
| 44582.520833333336 | 3.041 |
| 44582.53125 | 2.995 |
| 44582.541666666664 | 2.96 |
| 44582.552083333336 | 2.944 |
| 44582.5625 | 2.945 |
| 44582.572916666664 | 2.959 |
| 44582.583333333336 | 2.994 |
| 44582.59375 | 3.014 |
| 44582.604166666664 | 3.092 |
| 44582.614583333336 | 3.154 |
| 44582.625 | 3.235 |
| 44582.635416666664 | 3.28 |
| 44582.645833333336 | 3.303 |
| 44582.65625 | 3.311 |
| 44582.666666666664 | 3.326 |
| 44582.677083333336 | 3.336 |
| 44582.6875 | 3.293 |
| 44582.697916666664 | 3.214 |
| 44582.708333333336 | 3.302 |
| 44582.71875 | 3.222 |
| 44582.729166666664 | 3.161 |
| 44582.739583333336 | 3.168 |
| 44582.75 | 3.033 |
| 44582.760416666664 | 3.064 |
| 44582.770833333336 | 2.867 |
| 44582.78125 | 2.769 |
| 44582.791666666664 | 2.733 |
| 44582.802083333336 | 2.691 |
| 44582.8125 | 2.684 |
| 44582.822916666664 | 2.664 |
| 44582.833333333336 | 2.641 |
| 44582.84375 | 2.646 |
| 44582.854166666664 | 2.593 |
| 44582.864583333336 | 2.541 |
| 44582.875 | 2.526 |
| 44582.885416666664 | 2.513 |
| 44582.895833333336 | 2.49 |
| 44582.90625 | 2.464 |
| 44582.916666666664 | 2.456 |
| 44582.927083333336 | 2.456 |
| 44582.9375 | 2.426 |
| 44582.947916666664 | 2.42 |
| 44582.958333333336 | 2.439 |
| 44582.96875 | 2.459 |
| 44582.979166666664 | 2.463 |
| 44582.989583333336 | 2.456 |
| 44583.0 | 2.453 |
| 44583.010416666664 | 2.493 |
| 44583.020833333336 | 2.497 |
| 44583.03125 | 2.457 |
| 44583.041666666664 | 2.384 |
| 44583.052083333336 | 2.31 |
| 44583.0625 | 2.256 |
| 44583.072916666664 | 2.229 |
| 44583.083333333336 | 2.212 |
| 44583.09375 | 2.203 |
| 44583.104166666664 | 2.2 |
| 44583.114583333336 | 2.164 |
| 44583.125 | 2.145 |
| 44583.135416666664 | 2.142 |
| 44583.145833333336 | 2.146 |
| 44583.15625 | 2.156 |
| 44583.166666666664 | 2.146 |
| 44583.177083333336 | 2.154 |
| 44583.1875 | 2.149 |
| 44583.197916666664 | 2.284 |
| 44583.208333333336 | 2.207 |
| 44583.21875 | 2.137 |
| 44583.229166666664 | 1.996 |
| 44583.239583333336 | 1.918 |
| 44583.25 | 1.77 |
| 44583.260416666664 | 1.623 |
| 44583.270833333336 | 1.511 |
| 44583.28125 | 1.385 |
| 44583.291666666664 | 1.173 |
| 44583.302083333336 | 1.045 |
| 44583.3125 | 0.92 |
| 44583.322916666664 | 0.924 |
| 44583.333333333336 | 0.772 |
| 44583.34375 | 0.623 |
| 44583.354166666664 | 0.517 |
| 44583.364583333336 | 0.411 |
| 44583.375 | 0.452 |
| 44583.385416666664 | 0.458 |
| 44583.395833333336 | 0.442 |
| 44583.40625 | 0.427 |
| 44583.416666666664 | 0.434 |
| 44583.427083333336 | 0.438 |
| 44583.4375 | 0.405 |
| 44583.447916666664 | 0.347 |
| 44583.458333333336 | 0.425 |
| 44583.46875 | 0.457 |
| 44583.479166666664 | 0.466 |
| 44583.489583333336 | 0.458 |
| 44583.5 | 0.527 |
| 44583.510416666664 | 0.608 |
| 44583.520833333336 | 0.658 |
| 44583.53125 | 0.678 |
| 44583.541666666664 | 0.674 |
| 44583.552083333336 | 0.704 |
| 44583.5625 | 0.703 |
| 44583.572916666664 | 0.67 |
| 44583.583333333336 | 0.652 |
| 44583.59375 | 0.652 |
| 44583.604166666664 | 0.704 |
| 44583.614583333336 | 0.786 |
| 44583.625 | 0.876 |
| 44583.635416666664 | 0.964 |
| 44583.645833333336 | 1.092 |
| 44583.65625 | 1.228 |
| 44583.666666666664 | 1.374 |
| 44583.677083333336 | 1.46 |
| 44583.6875 | 1.534 |
| 44583.697916666664 | 1.548 |
| 44583.708333333336 | 1.657 |
| 44583.71875 | 1.612 |
| 44583.729166666664 | 1.726 |
| 44583.739583333336 | 1.708 |
| 44583.75 | 1.712 |
| 44583.760416666664 | 1.745 |
| 44583.770833333336 | 1.797 |
| 44583.78125 | 1.74 |
| 44583.791666666664 | 1.864 |
| 44583.802083333336 | 1.749 |
| 44583.8125 | 1.861 |
| 44583.822916666664 | 1.903 |
| 44583.833333333336 | 1.925 |
| 44583.84375 | 2.066 |
| 44583.854166666664 | 2.095 |
| 44583.864583333336 | 2.192 |
| 44583.875 | 2.319 |
| 44583.885416666664 | 2.277 |
| 44583.895833333336 | 2.098 |
| 44583.90625 | 1.976 |
| 44583.916666666664 | 1.842 |
| 44583.927083333336 | 1.876 |
| 44583.9375 | 1.741 |
| 44583.947916666664 | 1.737 |
| 44583.958333333336 | 1.758 |
| 44583.96875 | 1.8 |
| 44583.979166666664 | 1.816 |
| 44583.989583333336 | 1.819 |
| 44584.0 | 1.819 |
| 44584.010416666664 | 1.851 |
| 44584.020833333336 | 1.857 |
| 44584.03125 | 1.888 |
| 44584.041666666664 | 1.933 |
| 44584.052083333336 | 1.995 |
| 44584.0625 | 2.102 |
| 44584.072916666664 | 2.01 |
| 44584.083333333336 | 1.886 |
| 44584.09375 | 1.873 |
| 44584.104166666664 | 1.853 |
| 44584.114583333336 | 1.804 |
| 44584.125 | 1.771 |
| 44584.135416666664 | 1.733 |
| 44584.145833333336 | 1.73 |
| 44584.15625 | 1.738 |
| 44584.166666666664 | 1.746 |
| 44584.177083333336 | 1.74 |
| 44584.1875 | 1.776 |
| 44584.197916666664 | 1.817 |
| 44584.208333333336 | 1.887 |
| 44584.21875 | 2.091 |
| 44584.229166666664 | 2.011 |
| 44584.239583333336 | 1.866 |
| 44584.25 | 1.621 |
| 44584.260416666664 | 1.697 |
| 44584.270833333336 | 1.598 |
| 44584.28125 | 1.519 |
| 44584.291666666664 | 1.44 |
| 44584.302083333336 | 1.229 |
| 44584.3125 | 1.126 |
| 44584.322916666664 | 0.863 |
| 44584.333333333336 | 0.639 |
| 44584.34375 | 0.655 |
| 44584.354166666664 | 0.515 |
| 44584.364583333336 | 0.468 |
| 44584.375 | 0.551 |
| 44584.385416666664 | 0.552 |
| 44584.395833333336 | 0.597 |
| 44584.40625 | 0.586 |
| 44584.416666666664 | 0.539 |
| 44584.427083333336 | 0.624 |
| 44584.4375 | 0.587 |
| 44584.447916666664 | 0.61 |
| 44584.458333333336 | 0.566 |
| 44584.46875 | 0.608 |
| 44584.479166666664 | 0.552 |
| 44584.489583333336 | 0.542 |
| 44584.5 | 0.598 |
| 44584.510416666664 | 0.594 |
| 44584.520833333336 | 0.586 |
| 44584.53125 | 0.587 |
| 44584.541666666664 | 0.726 |
| 44584.552083333336 | 0.822 |
| 44584.5625 | 0.906 |
| 44584.572916666664 | 1.015 |
| 44584.583333333336 | 1.067 |
| 44584.59375 | 1.092 |
| 44584.604166666664 | 1.152 |
| 44584.614583333336 | 1.165 |
| 44584.625 | 1.19 |
| 44584.635416666664 | 1.226 |
| 44584.645833333336 | 1.274 |
| 44584.65625 | 1.378 |
| 44584.666666666664 | 1.535 |
| 44584.677083333336 | 1.703 |
| 44584.6875 | 1.826 |
| 44584.697916666664 | 1.921 |
| 44584.708333333336 | 2.009 |
| 44584.71875 | 2.045 |
| 44584.729166666664 | 2.082 |
| 44584.739583333336 | 2.067 |
| 44584.75 | 2.122 |
| 44584.760416666664 | 2.266 |
| 44584.770833333336 | 2.486 |
| 44584.78125 | 2.715 |
| 44584.791666666664 | 2.806 |
| 44584.802083333336 | 2.793 |
| 44584.8125 | 2.881 |
| 44584.822916666664 | 2.813 |
| 44584.833333333336 | 3.007 |
| 44584.84375 | 3.227 |
| 44584.854166666664 | 3.1 |
| 44584.864583333336 | 3.092 |
| 44584.875 | 3.408 |
| 44584.885416666664 | 3.351 |
| 44584.895833333336 | 3.228 |
| 44584.90625 | 3.104 |
| 44584.916666666664 | 3.102 |
| 44584.927083333336 | 2.958 |
| 44584.9375 | 2.776 |
| 44584.947916666664 | 2.58 |
| 44584.958333333336 | 2.574 |
| 44584.96875 | 2.553 |
| 44584.979166666664 | 2.555 |
| 44584.989583333336 | 2.555 |
| 44585.0 | 2.562 |
| 44585.010416666664 | 2.593 |
| 44585.020833333336 | 2.622 |
| 44585.03125 | 2.646 |
| 44585.041666666664 | 2.704 |
| 44585.052083333336 | 2.735 |
| 44585.0625 | 2.76 |
| 44585.072916666664 | 2.736 |
| 44585.083333333336 | 2.727 |
| 44585.09375 | 2.704 |
| 44585.104166666664 | 2.689 |
| 44585.114583333336 | 2.654 |
| 44585.125 | 2.616 |
| 44585.135416666664 | 2.593 |
| 44585.145833333336 | 2.575 |
| 44585.15625 | 2.561 |
| 44585.166666666664 | 2.548 |
| 44585.177083333336 | 2.534 |
| 44585.1875 | 2.527 |
| 44585.197916666664 | 2.534 |
| 44585.208333333336 | 2.547 |
| 44585.21875 | 2.571 |
| 44585.229166666664 | 2.583 |
| 44585.239583333336 | 2.588 |
| 44585.25 | 2.622 |
| 44585.260416666664 | 2.614 |
| 44585.270833333336 | 2.589 |
| 44585.28125 | 2.489 |
| 44585.291666666664 | 2.444 |
| 44585.302083333336 | 2.323 |
| 44585.3125 | 2.263 |
| 44585.322916666664 | 2.341 |
| 44585.333333333336 | 2.206 |
| 44585.34375 | 2.156 |
| 44585.354166666664 | 2.032 |
| 44585.364583333336 | 1.846 |
| 44585.375 | 1.72 |
| 44585.385416666664 | 1.678 |
| 44585.395833333336 | 1.665 |
| 44585.40625 | 1.707 |
| 44585.416666666664 | 1.737 |
| 44585.427083333336 | 1.73 |
| 44585.4375 | 1.699 |
| 44585.447916666664 | 1.645 |
| 44585.458333333336 | 1.563 |
| 44585.46875 | 1.572 |
| 44585.479166666664 | 1.563 |
| 44585.489583333336 | 1.561 |
| 44585.5 | 1.475 |
| 44585.510416666664 | 1.572 |
| 44585.520833333336 | 1.601 |
| 44585.53125 | 1.64 |
| 44585.541666666664 | 1.703 |
| 44585.552083333336 | 1.741 |
| 44585.5625 | 1.758 |
| 44585.572916666664 | 1.801 |
| 44585.583333333336 | 1.9 |
| 44585.59375 | 1.908 |
| 44585.604166666664 | 1.934 |
| 44585.614583333336 | 1.983 |
| 44585.625 | 2.017 |
| 44585.635416666664 | 2.035 |
| 44585.645833333336 | 2.058 |
| 44585.65625 | 2.102 |
| 44585.666666666664 | 2.152 |
| 44585.677083333336 | 2.202 |
| 44585.6875 | 2.269 |
| 44585.697916666664 | 2.338 |
| 44585.708333333336 | 2.411 |
| 44585.71875 | 2.485 |
| 44585.729166666664 | 2.581 |
| 44585.739583333336 | 2.672 |
| 44585.75 | 2.729 |
| 44585.760416666664 | 2.786 |
| 44585.770833333336 | 2.749 |
| 44585.78125 | 3.013 |
| 44585.791666666664 | 3.443 |
| 44585.802083333336 | 3.426 |
| 44585.8125 | 3.364 |
| 44585.822916666664 | 3.481 |
| 44585.833333333336 | 3.514 |
| 44585.84375 | 3.561 |
| 44585.854166666664 | 3.926 |
| 44585.864583333336 | 4.426 |
| 44585.875 | 4.377 |
| 44585.885416666664 | 4.37 |
| 44585.895833333336 | 4.618 |
| 44585.90625 | 4.539 |
| 44585.916666666664 | 4.416 |
| 44585.927083333336 | 4.097 |
| 44585.9375 | 3.967 |
| 44585.947916666664 | 3.923 |
| 44585.958333333336 | 3.854 |
| 44585.96875 | 3.781 |
| 44585.979166666664 | 3.768 |
| 44585.989583333336 | 3.709 |
| 44586.0 | 3.711 |
| 44586.010416666664 | 3.699 |
| 44586.020833333336 | 3.691 |
| 44586.03125 | 3.668 |
| 44586.041666666664 | 3.716 |
| 44586.052083333336 | 3.704 |
| 44586.0625 | 3.695 |
| 44586.072916666664 | 3.738 |
| 44586.083333333336 | 3.77 |
| 44586.09375 | 3.777 |
| 44586.104166666664 | 3.762 |
| 44586.114583333336 | 3.694 |
| 44586.125 | 3.559 |
| 44586.135416666664 | 3.487 |
| 44586.145833333336 | 3.466 |
| 44586.15625 | 3.442 |
| 44586.166666666664 | 3.394 |
| 44586.177083333336 | 3.344 |
| 44586.1875 | 3.325 |
| 44586.197916666664 | 3.296 |
| 44586.208333333336 | 3.276 |
| 44586.21875 | 3.252 |
| 44586.229166666664 | 3.233 |
| 44586.239583333336 | 3.225 |
| 44586.25 | 3.225 |
| 44586.260416666664 | 3.237 |
| 44586.270833333336 | 3.248 |
| 44586.28125 | 3.275 |
| 44586.291666666664 | 3.285 |
| 44586.302083333336 | 3.293 |
| 44586.3125 | 3.242 |
| 44586.322916666664 | 3.243 |
| 44586.333333333336 | 3.189 |
| 44586.34375 | 3.147 |
| 44586.354166666664 | 3.167 |
| 44586.364583333336 | 3.145 |
| 44586.375 | 3.139 |
| 44586.385416666664 | 3.095 |
| 44586.395833333336 | 3.065 |
| 44586.40625 | 3.014 |
| 44586.416666666664 | 3.027 |
| 44586.427083333336 | 3.027 |
| 44586.4375 | 2.97 |
| 44586.447916666664 | 3.003 |
| 44586.458333333336 | 2.988 |
| 44586.46875 | 2.964 |
| 44586.479166666664 | 2.972 |
| 44586.489583333336 | 2.969 |
| 44586.5 | 2.976 |
| 44586.510416666664 | 2.994 |
| 44586.520833333336 | 2.99 |
| 44586.53125 | 2.995 |
| 44586.541666666664 | 2.995 |
| 44586.552083333336 | 2.994 |
| 44586.5625 | 3.009 |
| 44586.572916666664 | 3.026 |
| 44586.583333333336 | 3.046 |
| 44586.59375 | 3.044 |
| 44586.604166666664 | 3.057 |
| 44586.614583333336 | 3.076 |
| 44586.625 | 3.105 |
| 44586.635416666664 | 3.141 |
| 44586.645833333336 | 3.174 |
| 44586.65625 | 3.212 |
| 44586.666666666664 | 3.249 |
| 44586.677083333336 | 3.29 |
| 44586.6875 | 3.324 |
| 44586.697916666664 | 3.357 |
| 44586.708333333336 | 3.391 |
| 44586.71875 | 3.422 |
| 44586.729166666664 | 3.455 |
| 44586.739583333336 | 3.493 |
| 44586.75 | 3.518 |
| 44586.760416666664 | 3.552 |
| 44586.770833333336 | 3.589 |
| 44586.78125 | 3.631 |
| 44586.791666666664 | 3.678 |
| 44586.802083333336 | 3.701 |
| 44586.8125 | 3.718 |
| 44586.822916666664 | 3.801 |
| 44586.833333333336 | 3.933 |
| 44586.84375 | 4.063 |
| 44586.854166666664 | 4.085 |
| 44586.864583333336 | 4.025 |
| 44586.875 | 4.014 |
| 44586.885416666664 | 4.358 |
| 44586.895833333336 | 4.401 |
| 44586.90625 | 4.496 |
| 44586.916666666664 | 4.494 |
| 44586.927083333336 | 4.537 |
| 44586.9375 | 4.562 |
| 44586.947916666664 | 4.579 |
| 44586.958333333336 | 4.585 |
| 44586.96875 | 4.566 |
| 44586.979166666664 | 4.587 |
| 44586.989583333336 | 4.605 |
| 44587.0 | 4.604 |
| 44587.010416666664 | 4.617 |
| 44587.020833333336 | 4.622 |
| 44587.03125 | 4.618 |
| 44587.041666666664 | 4.616 |
| 44587.052083333336 | 4.599 |
| 44587.0625 | 4.544 |
| 44587.072916666664 | 4.563 |
| 44587.083333333336 | 4.549 |
| 44587.09375 | 4.52 |
| 44587.104166666664 | 4.488 |
| 44587.114583333336 | 4.461 |
| 44587.125 | 4.365 |
| 44587.135416666664 | 4.303 |
| 44587.145833333336 | 4.243 |
| 44587.15625 | 4.166 |
| 44587.166666666664 | 4.1 |
| 44587.177083333336 | 4.032 |
| 44587.1875 | 3.932 |
| 44587.197916666664 | 3.857 |
| 44587.208333333336 | 3.788 |
| 44587.21875 | 3.738 |
| 44587.229166666664 | 3.714 |
| 44587.239583333336 | 3.698 |
| 44587.25 | 3.713 |
| 44587.260416666664 | 3.718 |
| 44587.270833333336 | 3.712 |
| 44587.28125 | 3.701 |
| 44587.291666666664 | 3.693 |
| 44587.302083333336 | 3.687 |
| 44587.3125 | 3.682 |
| 44587.322916666664 | 3.659 |
| 44587.333333333336 | 3.685 |
| 44587.34375 | 3.65 |
| 44587.354166666664 | 3.627 |
| 44587.364583333336 | 3.612 |
| 44587.375 | 3.515 |
| 44587.385416666664 | 3.489 |
| 44587.395833333336 | 3.442 |
| 44587.40625 | 3.345 |
| 44587.416666666664 | 3.203 |
| 44587.427083333336 | 3.223 |
| 44587.4375 | 3.146 |
| 44587.447916666664 | 2.994 |
| 44587.458333333336 | 2.841 |
| 44587.46875 | 2.668 |
| 44587.479166666664 | 2.565 |
| 44587.489583333336 | 2.551 |
| 44587.5 | 2.605 |
| 44587.510416666664 | 2.604 |
| 44587.520833333336 | 2.573 |
| 44587.53125 | 2.54 |
| 44587.541666666664 | 2.588 |
| 44587.552083333336 | 2.549 |
| 44587.5625 | 2.556 |
| 44587.572916666664 | 2.529 |
| 44587.583333333336 | 2.536 |
| 44587.59375 | 2.54 |
| 44587.604166666664 | 2.539 |
| 44587.614583333336 | 2.549 |
| 44587.625 | 2.588 |
| 44587.635416666664 | 2.625 |
| 44587.645833333336 | 2.657 |
| 44587.65625 | 2.642 |
| 44587.666666666664 | 2.637 |
| 44587.677083333336 | 2.657 |
| 44587.6875 | 2.685 |
| 44587.697916666664 | 2.689 |
| 44587.708333333336 | 2.702 |
| 44587.71875 | 2.736 |
| 44587.729166666664 | 2.769 |
| 44587.739583333336 | 2.784 |
| 44587.75 | 2.819 |
| 44587.760416666664 | 2.842 |
| 44587.770833333336 | 2.875 |
| 44587.78125 | 2.912 |
| 44587.791666666664 | 2.953 |
| 44587.802083333336 | 2.99 |
| 44587.8125 | 3.021 |
| 44587.822916666664 | 3.04 |
| 44587.833333333336 | 3.07 |
| 44587.84375 | 3.106 |
| 44587.854166666664 | 3.135 |
| 44587.864583333336 | 3.161 |
| 44587.875 | 3.209 |
| 44587.885416666664 | 3.252 |
| 44587.895833333336 | 3.331 |
| 44587.90625 | 3.339 |
| 44587.916666666664 | 3.383 |
| 44587.927083333336 | 3.405 |
| 44587.9375 | 3.431 |
| 44587.947916666664 | 3.437 |
| 44587.958333333336 | 3.442 |
| 44587.96875 | 3.429 |
| 44587.979166666664 | 3.417 |
| 44587.989583333336 | 3.346 |
| 44588.0 | 3.242 |
| 44588.010416666664 | 3.195 |
| 44588.020833333336 | 3.106 |
| 44588.03125 | 3.045 |
| 44588.041666666664 | 2.987 |
| 44588.052083333336 | 2.939 |
| 44588.0625 | 2.864 |
| 44588.072916666664 | 2.8 |
| 44588.083333333336 | 2.755 |
| 44588.09375 | 2.725 |
| 44588.104166666664 | 2.693 |
| 44588.114583333336 | 2.692 |
| 44588.125 | 2.722 |
| 44588.135416666664 | 2.749 |
| 44588.145833333336 | 2.798 |
| 44588.15625 | 2.839 |
| 44588.166666666664 | 2.81 |
| 44588.177083333336 | 2.76 |
| 44588.1875 | 2.63 |
| 44588.197916666664 | 2.523 |
| 44588.208333333336 | 2.419 |
| 44588.21875 | 2.331 |
| 44588.229166666664 | 2.232 |
| 44588.239583333336 | 2.138 |
| 44588.25 | 2.048 |
| 44588.260416666664 | 2.001 |
| 44588.270833333336 | 1.972 |
| 44588.28125 | 1.975 |
| 44588.291666666664 | 2.032 |
| 44588.302083333336 | 2.108 |
| 44588.3125 | 2.163 |
| 44588.322916666664 | 2.217 |
| 44588.333333333336 | 2.251 |
| 44588.34375 | 2.251 |
| 44588.354166666664 | 2.272 |
| 44588.364583333336 | 2.271 |
| 44588.375 | 2.28 |
| 44588.385416666664 | 2.237 |
| 44588.395833333336 | 2.218 |
| 44588.40625 | 2.126 |
| 44588.416666666664 | 2.041 |
| 44588.427083333336 | 1.9 |
| 44588.4375 | 1.738 |
| 44588.447916666664 | 1.566 |
| 44588.458333333336 | 1.457 |
| 44588.46875 | 1.281 |
| 44588.479166666664 | 1.167 |
| 44588.489583333336 | 0.804 |
| 44588.5 | 0.324 |
| 44588.510416666664 | 0.375 |
| 44588.520833333336 | 0.351 |
| 44588.53125 | 0.42 |
| 44588.541666666664 | 0.453 |
| 44588.552083333336 | 0.521 |
| 44588.5625 | 0.541 |
| 44588.572916666664 | 0.576 |
| 44588.583333333336 | 0.581 |
| 44588.59375 | 0.653 |
| 44588.604166666664 | 0.726 |
| 44588.614583333336 | 0.846 |
| 44588.625 | 0.909 |
| 44588.635416666664 | 0.949 |
| 44588.645833333336 | 0.938 |
| 44588.65625 | 1.016 |
| 44588.666666666664 | 0.963 |
| 44588.677083333336 | 1.126 |
| 44588.6875 | 0.934 |
| 44588.697916666664 | 0.986 |
| 44588.708333333336 | 0.983 |
| 44588.71875 | 1.026 |
| 44588.729166666664 | 1.148 |
| 44588.739583333336 | 1.336 |
| 44588.75 | 1.58 |
| 44588.760416666664 | 1.709 |
| 44588.770833333336 | 1.761 |
| 44588.78125 | 1.85 |
| 44588.791666666664 | 2.061 |
| 44588.802083333336 | 2.216 |
| 44588.8125 | 2.332 |
| 44588.822916666664 | 2.462 |
| 44588.833333333336 | 2.51 |
| 44588.84375 | 2.59 |
| 44588.854166666664 | 2.61 |
| 44588.864583333336 | 2.677 |
| 44588.875 | 2.687 |
| 44588.885416666664 | 2.683 |
| 44588.895833333336 | 2.733 |
| 44588.90625 | 2.77 |
| 44588.916666666664 | 2.905 |
| 44588.927083333336 | 2.828 |
| 44588.9375 | 2.819 |
| 44588.947916666664 | 2.787 |
| 44588.958333333336 | 2.776 |
| 44588.96875 | 2.723 |
| 44588.979166666664 | 2.715 |
| 44588.989583333336 | 2.709 |
| 44589.0 | 2.755 |
| 44589.010416666664 | 2.733 |
| 44589.020833333336 | 2.705 |
| 44589.03125 | 2.739 |
| 44589.041666666664 | 2.656 |
| 44589.052083333336 | 2.603 |
| 44589.0625 | 2.532 |
| 44589.072916666664 | 2.495 |
| 44589.083333333336 | 2.486 |
| 44589.09375 | 2.392 |
| 44589.104166666664 | 2.318 |
| 44589.114583333336 | 2.279 |
| 44589.125 | 2.231 |
| 44589.135416666664 | 2.257 |
| 44589.145833333336 | 2.259 |
| 44589.15625 | 2.268 |
| 44589.166666666664 | 2.277 |
| 44589.177083333336 | 2.311 |
| 44589.1875 | 2.343 |
| 44589.197916666664 | 2.39 |
| 44589.208333333336 | 2.418 |
| 44589.21875 | 2.405 |
| 44589.229166666664 | 2.404 |
| 44589.239583333336 | 2.377 |
| 44589.25 | 2.341 |
| 44589.260416666664 | 2.294 |
| 44589.270833333336 | 2.269 |
| 44589.28125 | 2.258 |
| 44589.291666666664 | 2.269 |
| 44589.302083333336 | 2.306 |
| 44589.3125 | 2.346 |
| 44589.322916666664 | 2.341 |
| 44589.333333333336 | 2.338 |
| 44589.34375 | 2.332 |
| 44589.354166666664 | 2.327 |
| 44589.364583333336 | 2.314 |
| 44589.375 | 2.311 |
| 44589.385416666664 | 2.31 |
| 44589.395833333336 | 2.307 |
| 44589.40625 | 2.302 |
| 44589.416666666664 | 2.294 |
| 44589.427083333336 | 2.319 |
| 44589.4375 | 2.26 |
| 44589.447916666664 | 2.236 |
| 44589.458333333336 | 2.128 |
| 44589.46875 | 2.095 |
| 44589.479166666664 | 1.97 |
| 44589.489583333336 | 1.846 |
| 44589.5 | 1.856 |
| 44589.510416666664 | 1.867 |
| 44589.520833333336 | 1.767 |
| 44589.53125 | 1.637 |
| 44589.541666666664 | 1.4 |
| 44589.552083333336 | 1.389 |
| 44589.5625 | 1.388 |
| 44589.572916666664 | 1.442 |
| 44589.583333333336 | 1.573 |
| 44589.59375 | 1.655 |
| 44589.604166666664 | 1.748 |
| 44589.614583333336 | 1.761 |
| 44589.625 | 1.827 |
| 44589.635416666664 | 1.887 |
| 44589.645833333336 | 1.944 |
| 44589.65625 | 2.027 |
| 44589.666666666664 | 2.063 |
| 44589.677083333336 | 2.162 |
| 44589.6875 | 2.205 |
| 44589.697916666664 | 2.23 |
| 44589.708333333336 | 2.212 |
| 44589.71875 | 2.198 |
| 44589.729166666664 | 2.238 |
| 44589.739583333336 | 2.226 |
| 44589.75 | 2.247 |
| 44589.760416666664 | 2.301 |
| 44589.770833333336 | 2.424 |
| 44589.78125 | 2.551 |
| 44589.791666666664 | 2.635 |
| 44589.802083333336 | 2.732 |
| 44589.8125 | 2.795 |
| 44589.822916666664 | 2.859 |
| 44589.833333333336 | 2.914 |
| 44589.84375 | 2.991 |
| 44589.854166666664 | 3.061 |
| 44589.864583333336 | 3.12 |
| 44589.875 | 3.16 |
| 44589.885416666664 | 3.216 |
| 44589.895833333336 | 3.266 |
| 44589.90625 | 3.279 |
| 44589.916666666664 | 3.243 |
| 44589.927083333336 | 3.296 |
| 44589.9375 | 3.285 |
| 44589.947916666664 | 3.225 |
| 44589.958333333336 | 3.263 |
| 44589.96875 | 3.269 |
| 44589.979166666664 | 3.263 |
| 44589.989583333336 | 3.243 |
| 44590.0 | 3.25 |
| 44590.010416666664 | 3.228 |
| 44590.020833333336 | 3.246 |
| 44590.03125 | 3.222 |
| 44590.041666666664 | 3.225 |
| 44590.052083333336 | 3.236 |
| 44590.0625 | 3.256 |
| 44590.072916666664 | 3.222 |
| 44590.083333333336 | 3.16 |
| 44590.09375 | 3.118 |
| 44590.104166666664 | 3.059 |
| 44590.114583333336 | 2.957 |
| 44590.125 | 2.845 |
| 44590.135416666664 | 2.787 |
| 44590.145833333336 | 2.766 |
| 44590.15625 | 2.723 |
| 44590.166666666664 | 2.8 |
| 44590.177083333336 | 2.664 |
| 44590.1875 | 2.722 |
| 44590.197916666664 | 2.77 |
| 44590.208333333336 | 2.744 |
| 44590.21875 | 2.743 |
| 44590.229166666664 | 2.729 |
| 44590.239583333336 | 2.685 |
| 44590.25 | 2.588 |
| 44590.260416666664 | 2.512 |
| 44590.270833333336 | 2.419 |
| 44590.28125 | 2.31 |
| 44590.291666666664 | 2.23 |
| 44590.302083333336 | 2.161 |
| 44590.3125 | 2.098 |
| 44590.322916666664 | 2.046 |
| 44590.333333333336 | 2.026 |
| 44590.34375 | 2.024 |
| 44590.354166666664 | 2.03 |
| 44590.364583333336 | 2.081 |
| 44590.375 | 2.12 |
| 44590.385416666664 | 2.149 |
| 44590.395833333336 | 2.153 |
| 44590.40625 | 2.156 |
| 44590.416666666664 | 2.169 |
| 44590.427083333336 | 2.187 |
| 44590.4375 | 2.18 |
| 44590.447916666664 | 2.183 |
| 44590.458333333336 | 2.185 |
| 44590.46875 | 2.076 |
| 44590.479166666664 | 2.115 |
| 44590.489583333336 | 2.104 |
| 44590.5 | 2.123 |
| 44590.510416666664 | 2.04 |
| 44590.520833333336 | 1.888 |
| 44590.53125 | 1.716 |
| 44590.541666666664 | 1.573 |
| 44590.552083333336 | 1.518 |
| 44590.5625 | 1.482 |
| 44590.572916666664 | 1.423 |
| 44590.583333333336 | 1.266 |
| 44590.59375 | 1.136 |
| 44590.604166666664 | 1.151 |
| 44590.614583333336 | 0.996 |
| 44590.625 | 0.979 |
| 44590.635416666664 | 0.996 |
| 44590.645833333336 | 0.961 |
| 44590.65625 | 0.896 |
| 44590.666666666664 | 0.95 |
| 44590.677083333336 | 0.812 |
| 44590.6875 | 0.828 |
| 44590.697916666664 | 0.789 |
| 44590.708333333336 | 0.821 |
| 44590.71875 | 0.859 |
| 44590.729166666664 | 0.845 |
| 44590.739583333336 | 0.864 |
| 44590.75 | 0.928 |
| 44590.760416666664 | 0.978 |
| 44590.770833333336 | 1.001 |
| 44590.78125 | 1.014 |
| 44590.791666666664 | 1.021 |
| 44590.802083333336 | 1.121 |
| 44590.8125 | 1.292 |
| 44590.822916666664 | 1.389 |
| 44590.833333333336 | 1.449 |
| 44590.84375 | 1.467 |
| 44590.854166666664 | 1.508 |
| 44590.864583333336 | 1.517 |
| 44590.875 | 1.537 |
| 44590.885416666664 | 1.562 |
| 44590.895833333336 | 1.538 |
| 44590.90625 | 1.596 |
| 44590.916666666664 | 1.683 |
| 44590.927083333336 | 1.724 |
| 44590.9375 | 1.76 |
| 44590.947916666664 | 1.786 |
| 44590.958333333336 | 1.787 |
| 44590.96875 | 1.778 |
| 44590.979166666664 | 1.774 |
| 44590.989583333336 | 1.711 |
| 44591.0 | 1.736 |
| 44591.010416666664 | 1.731 |
| 44591.020833333336 | 1.663 |
| 44591.03125 | 1.578 |
| 44591.041666666664 | 1.475 |
| 44591.052083333336 | 1.351 |
| 44591.0625 | 1.292 |
| 44591.072916666664 | 1.178 |
| 44591.083333333336 | 1.024 |
| 44591.09375 | 0.835 |
| 44591.104166666664 | 0.644 |
| 44591.114583333336 | 0.517 |
| 44591.125 | 0.536 |
| 44591.135416666664 | 0.468 |
| 44591.145833333336 | 0.32 |
| 44591.15625 | 0.2 |
| 44591.166666666664 | 0.114 |
| 44591.177083333336 | -0.007 |
| 44591.1875 | -0.069 |
| 44591.197916666664 | -0.111 |
| 44591.208333333336 | -0.171 |
| 44591.21875 | -0.221 |
| 44591.229166666664 | -0.272 |
| 44591.239583333336 | -0.226 |
| 44591.25 | -0.249 |
| 44591.260416666664 | -0.182 |
| 44591.270833333336 | -0.124 |
| 44591.28125 | -0.106 |
| 44591.291666666664 | -0.129 |
| 44591.302083333336 | -0.184 |
| 44591.3125 | -0.195 |
| 44591.322916666664 | -0.203 |
| 44591.333333333336 | -0.279 |
| 44591.34375 | -0.331 |
| 44591.354166666664 | -0.373 |
| 44591.364583333336 | -0.352 |
| 44591.375 | -0.223 |
| 44591.385416666664 | -0.021 |
| 44591.395833333336 | 0.171 |
| 44591.40625 | 0.28 |
| 44591.416666666664 | 0.317 |
| 44591.427083333336 | 0.328 |
| 44591.4375 | 0.326 |
| 44591.447916666664 | 0.324 |
| 44591.458333333336 | 0.31 |
| 44591.46875 | 0.335 |
| 44591.479166666664 | 0.373 |
| 44591.489583333336 | 0.416 |
| 44591.5 | 0.515 |
| 44591.510416666664 | 0.533 |
| 44591.520833333336 | 0.329 |
| 44591.53125 | 0.359 |
| 44591.541666666664 | 0.492 |
| 44591.552083333336 | 0.33 |
| 44591.5625 | 0.204 |
| 44591.572916666664 | 0.074 |
| 44591.583333333336 | 0.035 |
| 44591.59375 | -0.071 |
| 44591.604166666664 | -0.207 |
| 44591.614583333336 | 0 |
| 44591.625 | -0.39 |
| 44591.635416666664 | -0.486 |
| 44591.645833333336 | -0.326 |
| 44591.65625 | -0.255 |
| 44591.666666666664 | -0.158 |
| 44591.677083333336 | -0.027 |
| 44591.6875 | 0.037 |
| 44591.697916666664 | 0.147 |
| 44591.708333333336 | 0.22 |
| 44591.71875 | 0.151 |
| 44591.729166666664 | 0.139 |
| 44591.739583333336 | 0.136 |
| 44591.75 | 0.107 |
| 44591.760416666664 | 0.157 |
| 44591.770833333336 | 0.203 |
| 44591.78125 | 0.387 |
| 44591.791666666664 | 0.396 |
| 44591.802083333336 | 0.422 |
| 44591.8125 | 0.371 |
| 44591.822916666664 | 0.383 |
| 44591.833333333336 | 0.455 |
| 44591.84375 | 0.561 |
| 44591.854166666664 | 0.702 |
| 44591.864583333336 | 0.89 |
| 44591.875 | 0.984 |
| 44591.885416666664 | 1.024 |
| 44591.895833333336 | 1.004 |
| 44591.90625 | 1.023 |
| 44591.916666666664 | 1.021 |
| 44591.927083333336 | 1.003 |
| 44591.9375 | 1.002 |
| 44591.947916666664 | 1.023 |
| 44591.958333333336 | 1.084 |
| 44591.96875 | 1.176 |
| 44591.979166666664 | 1.224 |
| 44591.989583333336 | 1.245 |
| 44592.0 | 1.233 |
| 44592.010416666664 | 1.118 |
| 44592.020833333336 | 1.163 |
| 44592.03125 | 1.143 |
| 44592.041666666664 | 1.022 |
| 44592.052083333336 | 1.074 |
| 44592.0625 | 1.038 |
| 44592.072916666664 | 1.093 |
| 44592.083333333336 | 1.107 |
| 44592.09375 | 1.018 |
| 44592.104166666664 | 0.95 |
| 44592.114583333336 | 0.869 |
| 44592.125 | 0.772 |
| 44592.135416666664 | 0.728 |
| 44592.145833333336 | 0.702 |
| 44592.15625 | 0.69 |
| 44592.166666666664 | 0.678 |
| 44592.177083333336 | 0.67 |
| 44592.1875 | 0.7 |
| 44592.197916666664 | 0.652 |
| 44592.208333333336 | 0.629 |
| 44592.21875 | 0.624 |
| 44592.229166666664 | 0.643 |
| 44592.239583333336 | 0.66 |
| 44592.25 | 0.689 |
| 44592.260416666664 | 0.676 |
| 44592.270833333336 | 0.618 |
| 44592.28125 | 0.63 |
| 44592.291666666664 | 0.622 |
| 44592.302083333336 | 0.608 |
| 44592.3125 | 0.597 |
| 44592.322916666664 | 0.596 |
| 44592.333333333336 | 0.614 |
| 44592.34375 | 0.611 |
| 44592.354166666664 | 0.598 |
| 44592.364583333336 | 0.538 |
| 44592.375 | 0.47 |
| 44592.385416666664 | 0.411 |
| 44592.395833333336 | 0.401 |
| 44592.40625 | 0.416 |
| 44592.416666666664 | 0.462 |
| 44592.427083333336 | 0.522 |
| 44592.4375 | 0.548 |
| 44592.447916666664 | 0.544 |
| 44592.458333333336 | 0.538 |
| 44592.46875 | 0.531 |
| 44592.479166666664 | 0.517 |
| 44592.489583333336 | 0.483 |
| 44592.5 | 0.463 |
| 44592.510416666664 | 0.457 |
| 44592.520833333336 | 0.447 |
| 44592.53125 | 0.449 |
| 44592.541666666664 | 0.45 |
| 44592.552083333336 | 0.545 |
| 44592.5625 | 0.556 |
| 44592.572916666664 | 0.499 |
| 44592.583333333336 | 0.466 |
| 44592.59375 | 0.511 |
| 44592.604166666664 | 0.538 |
| 44592.614583333336 | 0.541 |
| 44592.625 | 0.586 |
| 44592.635416666664 | 0.684 |
| 44592.645833333336 | 0.89 |
| 44592.65625 | 0.999 |
| 44592.666666666664 | 1.365 |
| 44592.677083333336 | 1.546 |
| 44592.6875 | 1.518 |
| 44592.697916666664 | 1.724 |
| 44592.708333333336 | 1.824 |
| 44592.71875 | 1.988 |
| 44592.729166666664 | 2.077 |
| 44592.739583333336 | 2.243 |
| 44592.75 | 2.328 |
| 44592.760416666664 | 2.428 |
| 44592.770833333336 | 2.364 |
| 44592.78125 | 2.463 |
| 44592.791666666664 | 2.344 |
| 44592.802083333336 | 2.273 |
| 44592.8125 | 2.803 |
| 44592.822916666664 | 2.666 |
| 44592.833333333336 | 2.674 |
| 44592.84375 | 2.631 |
| 44592.854166666664 | 2.554 |
| 44592.864583333336 | 2.432 |
| 44592.875 | 2.386 |
| 44592.885416666664 | 2.421 |
| 44592.895833333336 | 2.524 |
| 44592.90625 | 2.784 |
| 44592.916666666664 | 2.977 |
| 44592.927083333336 | 2.998 |
| 44592.9375 | 2.967 |
| 44592.947916666664 | 3.007 |
| 44592.958333333336 | 3.064 |
| 44592.96875 | 3.09 |
| 44592.979166666664 | 2.934 |
| 44592.989583333336 | 2.706 |
| 44593.0 | 2.536 |
| 44593.010416666664 | 2.406 |
| 44593.020833333336 | 2.347 |
| 44593.03125 | 2.324 |
| 44593.041666666664 | 2.268 |
| 44593.052083333336 | 2.354 |
| 44593.0625 | 2.29 |
| 44593.072916666664 | 2.194 |
| 44593.083333333336 | 2.158 |
| 44593.09375 | 2.194 |
| 44593.104166666664 | 2.165 |
| 44593.114583333336 | 2.15 |
| 44593.125 | 2.152 |
| 44593.135416666664 | 2.199 |
| 44593.145833333336 | 2.18 |
| 44593.15625 | 2.101 |